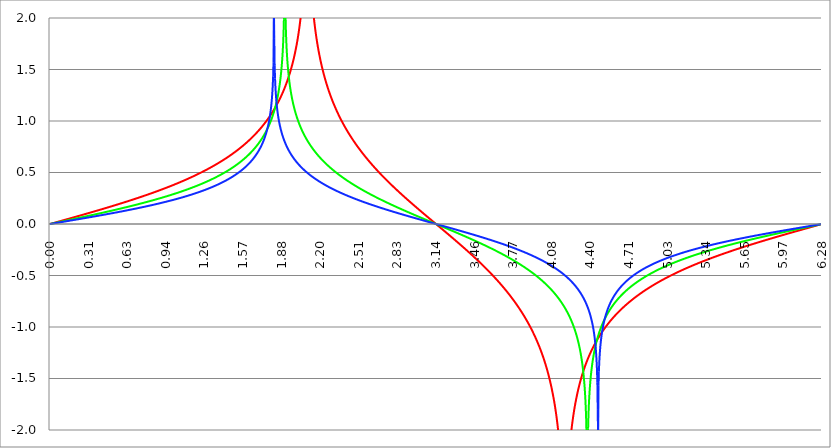
| Category | Series 1 | Series 0 | Series 2 |
|---|---|---|---|
| 0.0 | 0 | 0 | 0 |
| 0.00314159265358979 | 0.001 | 0.001 | 0.001 |
| 0.00628318530717958 | 0.002 | 0.002 | 0.001 |
| 0.00942477796076938 | 0.003 | 0.002 | 0.002 |
| 0.0125663706143592 | 0.004 | 0.003 | 0.003 |
| 0.015707963267949 | 0.005 | 0.004 | 0.003 |
| 0.0188495559215388 | 0.006 | 0.005 | 0.004 |
| 0.0219911485751285 | 0.007 | 0.005 | 0.004 |
| 0.0251327412287183 | 0.008 | 0.006 | 0.005 |
| 0.0282743338823081 | 0.009 | 0.007 | 0.006 |
| 0.0314159265358979 | 0.01 | 0.008 | 0.006 |
| 0.0345575191894877 | 0.012 | 0.009 | 0.007 |
| 0.0376991118430775 | 0.013 | 0.009 | 0.008 |
| 0.0408407044966673 | 0.014 | 0.01 | 0.008 |
| 0.0439822971502571 | 0.015 | 0.011 | 0.009 |
| 0.0471238898038469 | 0.016 | 0.012 | 0.009 |
| 0.0502654824574367 | 0.017 | 0.013 | 0.01 |
| 0.0534070751110265 | 0.018 | 0.013 | 0.011 |
| 0.0565486677646163 | 0.019 | 0.014 | 0.011 |
| 0.059690260418206 | 0.02 | 0.015 | 0.012 |
| 0.0628318530717958 | 0.021 | 0.016 | 0.013 |
| 0.0659734457253856 | 0.022 | 0.017 | 0.013 |
| 0.0691150383789754 | 0.023 | 0.017 | 0.014 |
| 0.0722566310325652 | 0.024 | 0.018 | 0.014 |
| 0.075398223686155 | 0.025 | 0.019 | 0.015 |
| 0.0785398163397448 | 0.026 | 0.02 | 0.016 |
| 0.0816814089933346 | 0.027 | 0.02 | 0.016 |
| 0.0848230016469244 | 0.028 | 0.021 | 0.017 |
| 0.0879645943005142 | 0.029 | 0.022 | 0.018 |
| 0.091106186954104 | 0.03 | 0.023 | 0.018 |
| 0.0942477796076937 | 0.031 | 0.024 | 0.019 |
| 0.0973893722612835 | 0.032 | 0.024 | 0.02 |
| 0.100530964914873 | 0.034 | 0.025 | 0.02 |
| 0.103672557568463 | 0.035 | 0.026 | 0.021 |
| 0.106814150222053 | 0.036 | 0.027 | 0.021 |
| 0.109955742875643 | 0.037 | 0.028 | 0.022 |
| 0.113097335529233 | 0.038 | 0.028 | 0.023 |
| 0.116238928182822 | 0.039 | 0.029 | 0.023 |
| 0.119380520836412 | 0.04 | 0.03 | 0.024 |
| 0.122522113490002 | 0.041 | 0.031 | 0.025 |
| 0.125663706143592 | 0.042 | 0.031 | 0.025 |
| 0.128805298797181 | 0.043 | 0.032 | 0.026 |
| 0.131946891450771 | 0.044 | 0.033 | 0.026 |
| 0.135088484104361 | 0.045 | 0.034 | 0.027 |
| 0.138230076757951 | 0.046 | 0.035 | 0.028 |
| 0.141371669411541 | 0.047 | 0.035 | 0.028 |
| 0.14451326206513 | 0.048 | 0.036 | 0.029 |
| 0.14765485471872 | 0.049 | 0.037 | 0.03 |
| 0.15079644737231 | 0.05 | 0.038 | 0.03 |
| 0.1539380400259 | 0.051 | 0.039 | 0.031 |
| 0.15707963267949 | 0.053 | 0.039 | 0.032 |
| 0.160221225333079 | 0.054 | 0.04 | 0.032 |
| 0.163362817986669 | 0.055 | 0.041 | 0.033 |
| 0.166504410640259 | 0.056 | 0.042 | 0.033 |
| 0.169646003293849 | 0.057 | 0.043 | 0.034 |
| 0.172787595947439 | 0.058 | 0.043 | 0.035 |
| 0.175929188601028 | 0.059 | 0.044 | 0.035 |
| 0.179070781254618 | 0.06 | 0.045 | 0.036 |
| 0.182212373908208 | 0.061 | 0.046 | 0.037 |
| 0.185353966561798 | 0.062 | 0.047 | 0.037 |
| 0.188495559215388 | 0.063 | 0.047 | 0.038 |
| 0.191637151868977 | 0.064 | 0.048 | 0.039 |
| 0.194778744522567 | 0.065 | 0.049 | 0.039 |
| 0.197920337176157 | 0.066 | 0.05 | 0.04 |
| 0.201061929829747 | 0.067 | 0.051 | 0.04 |
| 0.204203522483336 | 0.068 | 0.051 | 0.041 |
| 0.207345115136926 | 0.069 | 0.052 | 0.042 |
| 0.210486707790516 | 0.071 | 0.053 | 0.042 |
| 0.213628300444106 | 0.072 | 0.054 | 0.043 |
| 0.216769893097696 | 0.073 | 0.055 | 0.044 |
| 0.219911485751285 | 0.074 | 0.055 | 0.044 |
| 0.223053078404875 | 0.075 | 0.056 | 0.045 |
| 0.226194671058465 | 0.076 | 0.057 | 0.046 |
| 0.229336263712055 | 0.077 | 0.058 | 0.046 |
| 0.232477856365645 | 0.078 | 0.059 | 0.047 |
| 0.235619449019234 | 0.079 | 0.059 | 0.047 |
| 0.238761041672824 | 0.08 | 0.06 | 0.048 |
| 0.241902634326414 | 0.081 | 0.061 | 0.049 |
| 0.245044226980004 | 0.082 | 0.062 | 0.049 |
| 0.248185819633594 | 0.083 | 0.063 | 0.05 |
| 0.251327412287183 | 0.084 | 0.063 | 0.051 |
| 0.254469004940773 | 0.085 | 0.064 | 0.051 |
| 0.257610597594363 | 0.087 | 0.065 | 0.052 |
| 0.260752190247953 | 0.088 | 0.066 | 0.053 |
| 0.263893782901543 | 0.089 | 0.067 | 0.053 |
| 0.267035375555132 | 0.09 | 0.067 | 0.054 |
| 0.270176968208722 | 0.091 | 0.068 | 0.055 |
| 0.273318560862312 | 0.092 | 0.069 | 0.055 |
| 0.276460153515902 | 0.093 | 0.07 | 0.056 |
| 0.279601746169492 | 0.094 | 0.071 | 0.057 |
| 0.282743338823082 | 0.095 | 0.071 | 0.057 |
| 0.285884931476671 | 0.096 | 0.072 | 0.058 |
| 0.289026524130261 | 0.097 | 0.073 | 0.058 |
| 0.292168116783851 | 0.098 | 0.074 | 0.059 |
| 0.295309709437441 | 0.099 | 0.075 | 0.06 |
| 0.298451302091031 | 0.1 | 0.075 | 0.06 |
| 0.30159289474462 | 0.102 | 0.076 | 0.061 |
| 0.30473448739821 | 0.103 | 0.077 | 0.062 |
| 0.3078760800518 | 0.104 | 0.078 | 0.062 |
| 0.31101767270539 | 0.105 | 0.079 | 0.063 |
| 0.31415926535898 | 0.106 | 0.08 | 0.064 |
| 0.31730085801257 | 0.107 | 0.08 | 0.064 |
| 0.320442450666159 | 0.108 | 0.081 | 0.065 |
| 0.323584043319749 | 0.109 | 0.082 | 0.066 |
| 0.326725635973339 | 0.11 | 0.083 | 0.066 |
| 0.329867228626929 | 0.111 | 0.084 | 0.067 |
| 0.333008821280519 | 0.112 | 0.084 | 0.068 |
| 0.336150413934108 | 0.113 | 0.085 | 0.068 |
| 0.339292006587698 | 0.115 | 0.086 | 0.069 |
| 0.342433599241288 | 0.116 | 0.087 | 0.07 |
| 0.345575191894878 | 0.117 | 0.088 | 0.07 |
| 0.348716784548468 | 0.118 | 0.089 | 0.071 |
| 0.351858377202058 | 0.119 | 0.089 | 0.072 |
| 0.354999969855647 | 0.12 | 0.09 | 0.072 |
| 0.358141562509237 | 0.121 | 0.091 | 0.073 |
| 0.361283155162827 | 0.122 | 0.092 | 0.074 |
| 0.364424747816417 | 0.123 | 0.093 | 0.074 |
| 0.367566340470007 | 0.124 | 0.093 | 0.075 |
| 0.370707933123597 | 0.125 | 0.094 | 0.076 |
| 0.373849525777186 | 0.127 | 0.095 | 0.076 |
| 0.376991118430776 | 0.128 | 0.096 | 0.077 |
| 0.380132711084366 | 0.129 | 0.097 | 0.078 |
| 0.383274303737956 | 0.13 | 0.098 | 0.078 |
| 0.386415896391546 | 0.131 | 0.098 | 0.079 |
| 0.389557489045135 | 0.132 | 0.099 | 0.08 |
| 0.392699081698725 | 0.133 | 0.1 | 0.08 |
| 0.395840674352315 | 0.134 | 0.101 | 0.081 |
| 0.398982267005905 | 0.135 | 0.102 | 0.082 |
| 0.402123859659495 | 0.137 | 0.103 | 0.082 |
| 0.405265452313085 | 0.138 | 0.103 | 0.083 |
| 0.408407044966674 | 0.139 | 0.104 | 0.084 |
| 0.411548637620264 | 0.14 | 0.105 | 0.084 |
| 0.414690230273854 | 0.141 | 0.106 | 0.085 |
| 0.417831822927444 | 0.142 | 0.107 | 0.086 |
| 0.420973415581034 | 0.143 | 0.108 | 0.086 |
| 0.424115008234623 | 0.144 | 0.108 | 0.087 |
| 0.427256600888213 | 0.145 | 0.109 | 0.088 |
| 0.430398193541803 | 0.147 | 0.11 | 0.088 |
| 0.433539786195393 | 0.148 | 0.111 | 0.089 |
| 0.436681378848983 | 0.149 | 0.112 | 0.09 |
| 0.439822971502573 | 0.15 | 0.113 | 0.09 |
| 0.442964564156162 | 0.151 | 0.114 | 0.091 |
| 0.446106156809752 | 0.152 | 0.114 | 0.092 |
| 0.449247749463342 | 0.153 | 0.115 | 0.092 |
| 0.452389342116932 | 0.154 | 0.116 | 0.093 |
| 0.455530934770522 | 0.155 | 0.117 | 0.094 |
| 0.458672527424111 | 0.157 | 0.118 | 0.094 |
| 0.461814120077701 | 0.158 | 0.119 | 0.095 |
| 0.464955712731291 | 0.159 | 0.12 | 0.096 |
| 0.468097305384881 | 0.16 | 0.12 | 0.096 |
| 0.471238898038471 | 0.161 | 0.121 | 0.097 |
| 0.474380490692061 | 0.162 | 0.122 | 0.098 |
| 0.47752208334565 | 0.163 | 0.123 | 0.099 |
| 0.48066367599924 | 0.164 | 0.124 | 0.099 |
| 0.48380526865283 | 0.166 | 0.125 | 0.1 |
| 0.48694686130642 | 0.167 | 0.126 | 0.101 |
| 0.49008845396001 | 0.168 | 0.126 | 0.101 |
| 0.493230046613599 | 0.169 | 0.127 | 0.102 |
| 0.496371639267189 | 0.17 | 0.128 | 0.103 |
| 0.499513231920779 | 0.171 | 0.129 | 0.103 |
| 0.502654824574369 | 0.172 | 0.13 | 0.104 |
| 0.505796417227959 | 0.174 | 0.131 | 0.105 |
| 0.508938009881549 | 0.175 | 0.132 | 0.105 |
| 0.512079602535138 | 0.176 | 0.132 | 0.106 |
| 0.515221195188728 | 0.177 | 0.133 | 0.107 |
| 0.518362787842318 | 0.178 | 0.134 | 0.108 |
| 0.521504380495908 | 0.179 | 0.135 | 0.108 |
| 0.524645973149498 | 0.18 | 0.136 | 0.109 |
| 0.527787565803087 | 0.182 | 0.137 | 0.11 |
| 0.530929158456677 | 0.183 | 0.138 | 0.11 |
| 0.534070751110267 | 0.184 | 0.139 | 0.111 |
| 0.537212343763857 | 0.185 | 0.139 | 0.112 |
| 0.540353936417447 | 0.186 | 0.14 | 0.113 |
| 0.543495529071037 | 0.187 | 0.141 | 0.113 |
| 0.546637121724626 | 0.189 | 0.142 | 0.114 |
| 0.549778714378216 | 0.19 | 0.143 | 0.115 |
| 0.552920307031806 | 0.191 | 0.144 | 0.115 |
| 0.556061899685396 | 0.192 | 0.145 | 0.116 |
| 0.559203492338986 | 0.193 | 0.146 | 0.117 |
| 0.562345084992576 | 0.194 | 0.146 | 0.118 |
| 0.565486677646165 | 0.196 | 0.147 | 0.118 |
| 0.568628270299755 | 0.197 | 0.148 | 0.119 |
| 0.571769862953345 | 0.198 | 0.149 | 0.12 |
| 0.574911455606935 | 0.199 | 0.15 | 0.12 |
| 0.578053048260525 | 0.2 | 0.151 | 0.121 |
| 0.581194640914114 | 0.201 | 0.152 | 0.122 |
| 0.584336233567704 | 0.203 | 0.153 | 0.123 |
| 0.587477826221294 | 0.204 | 0.154 | 0.123 |
| 0.590619418874884 | 0.205 | 0.155 | 0.124 |
| 0.593761011528474 | 0.206 | 0.155 | 0.125 |
| 0.596902604182064 | 0.207 | 0.156 | 0.125 |
| 0.600044196835653 | 0.208 | 0.157 | 0.126 |
| 0.603185789489243 | 0.21 | 0.158 | 0.127 |
| 0.606327382142833 | 0.211 | 0.159 | 0.128 |
| 0.609468974796423 | 0.212 | 0.16 | 0.128 |
| 0.612610567450013 | 0.213 | 0.161 | 0.129 |
| 0.615752160103602 | 0.214 | 0.162 | 0.13 |
| 0.618893752757192 | 0.216 | 0.163 | 0.131 |
| 0.622035345410782 | 0.217 | 0.164 | 0.131 |
| 0.625176938064372 | 0.218 | 0.164 | 0.132 |
| 0.628318530717962 | 0.219 | 0.165 | 0.133 |
| 0.631460123371551 | 0.22 | 0.166 | 0.134 |
| 0.634601716025141 | 0.222 | 0.167 | 0.134 |
| 0.637743308678731 | 0.223 | 0.168 | 0.135 |
| 0.640884901332321 | 0.224 | 0.169 | 0.136 |
| 0.644026493985911 | 0.225 | 0.17 | 0.137 |
| 0.647168086639501 | 0.226 | 0.171 | 0.137 |
| 0.65030967929309 | 0.228 | 0.172 | 0.138 |
| 0.65345127194668 | 0.229 | 0.173 | 0.139 |
| 0.65659286460027 | 0.23 | 0.174 | 0.14 |
| 0.65973445725386 | 0.231 | 0.175 | 0.14 |
| 0.66287604990745 | 0.233 | 0.176 | 0.141 |
| 0.666017642561039 | 0.234 | 0.177 | 0.142 |
| 0.669159235214629 | 0.235 | 0.177 | 0.143 |
| 0.672300827868219 | 0.236 | 0.178 | 0.143 |
| 0.675442420521809 | 0.237 | 0.179 | 0.144 |
| 0.678584013175399 | 0.239 | 0.18 | 0.145 |
| 0.681725605828989 | 0.24 | 0.181 | 0.146 |
| 0.684867198482578 | 0.241 | 0.182 | 0.146 |
| 0.688008791136168 | 0.242 | 0.183 | 0.147 |
| 0.691150383789758 | 0.244 | 0.184 | 0.148 |
| 0.694291976443348 | 0.245 | 0.185 | 0.149 |
| 0.697433569096938 | 0.246 | 0.186 | 0.149 |
| 0.700575161750528 | 0.247 | 0.187 | 0.15 |
| 0.703716754404117 | 0.249 | 0.188 | 0.151 |
| 0.706858347057707 | 0.25 | 0.189 | 0.152 |
| 0.709999939711297 | 0.251 | 0.19 | 0.153 |
| 0.713141532364887 | 0.252 | 0.191 | 0.153 |
| 0.716283125018477 | 0.254 | 0.192 | 0.154 |
| 0.719424717672066 | 0.255 | 0.193 | 0.155 |
| 0.722566310325656 | 0.256 | 0.194 | 0.156 |
| 0.725707902979246 | 0.257 | 0.195 | 0.156 |
| 0.728849495632836 | 0.259 | 0.196 | 0.157 |
| 0.731991088286426 | 0.26 | 0.197 | 0.158 |
| 0.735132680940016 | 0.261 | 0.198 | 0.159 |
| 0.738274273593605 | 0.262 | 0.198 | 0.16 |
| 0.741415866247195 | 0.264 | 0.199 | 0.16 |
| 0.744557458900785 | 0.265 | 0.2 | 0.161 |
| 0.747699051554375 | 0.266 | 0.201 | 0.162 |
| 0.750840644207965 | 0.267 | 0.202 | 0.163 |
| 0.753982236861554 | 0.269 | 0.203 | 0.164 |
| 0.757123829515144 | 0.27 | 0.204 | 0.164 |
| 0.760265422168734 | 0.271 | 0.205 | 0.165 |
| 0.763407014822324 | 0.273 | 0.206 | 0.166 |
| 0.766548607475914 | 0.274 | 0.207 | 0.167 |
| 0.769690200129504 | 0.275 | 0.208 | 0.168 |
| 0.772831792783093 | 0.276 | 0.209 | 0.168 |
| 0.775973385436683 | 0.278 | 0.21 | 0.169 |
| 0.779114978090273 | 0.279 | 0.211 | 0.17 |
| 0.782256570743863 | 0.28 | 0.212 | 0.171 |
| 0.785398163397453 | 0.282 | 0.213 | 0.172 |
| 0.788539756051042 | 0.283 | 0.214 | 0.173 |
| 0.791681348704632 | 0.284 | 0.215 | 0.173 |
| 0.794822941358222 | 0.286 | 0.216 | 0.174 |
| 0.797964534011812 | 0.287 | 0.217 | 0.175 |
| 0.801106126665402 | 0.288 | 0.218 | 0.176 |
| 0.804247719318992 | 0.289 | 0.219 | 0.177 |
| 0.807389311972581 | 0.291 | 0.22 | 0.178 |
| 0.810530904626171 | 0.292 | 0.221 | 0.178 |
| 0.813672497279761 | 0.293 | 0.223 | 0.179 |
| 0.816814089933351 | 0.295 | 0.224 | 0.18 |
| 0.819955682586941 | 0.296 | 0.225 | 0.181 |
| 0.823097275240531 | 0.297 | 0.226 | 0.182 |
| 0.82623886789412 | 0.299 | 0.227 | 0.183 |
| 0.82938046054771 | 0.3 | 0.228 | 0.183 |
| 0.8325220532013 | 0.301 | 0.229 | 0.184 |
| 0.83566364585489 | 0.303 | 0.23 | 0.185 |
| 0.83880523850848 | 0.304 | 0.231 | 0.186 |
| 0.841946831162069 | 0.305 | 0.232 | 0.187 |
| 0.845088423815659 | 0.307 | 0.233 | 0.188 |
| 0.848230016469249 | 0.308 | 0.234 | 0.189 |
| 0.851371609122839 | 0.309 | 0.235 | 0.189 |
| 0.854513201776429 | 0.311 | 0.236 | 0.19 |
| 0.857654794430019 | 0.312 | 0.237 | 0.191 |
| 0.860796387083608 | 0.314 | 0.238 | 0.192 |
| 0.863937979737198 | 0.315 | 0.239 | 0.193 |
| 0.867079572390788 | 0.316 | 0.24 | 0.194 |
| 0.870221165044378 | 0.318 | 0.241 | 0.195 |
| 0.873362757697968 | 0.319 | 0.242 | 0.196 |
| 0.876504350351557 | 0.32 | 0.244 | 0.196 |
| 0.879645943005147 | 0.322 | 0.245 | 0.197 |
| 0.882787535658737 | 0.323 | 0.246 | 0.198 |
| 0.885929128312327 | 0.325 | 0.247 | 0.199 |
| 0.889070720965917 | 0.326 | 0.248 | 0.2 |
| 0.892212313619507 | 0.327 | 0.249 | 0.201 |
| 0.895353906273096 | 0.329 | 0.25 | 0.202 |
| 0.898495498926686 | 0.33 | 0.251 | 0.203 |
| 0.901637091580276 | 0.332 | 0.252 | 0.204 |
| 0.904778684233866 | 0.333 | 0.253 | 0.204 |
| 0.907920276887456 | 0.334 | 0.254 | 0.205 |
| 0.911061869541045 | 0.336 | 0.256 | 0.206 |
| 0.914203462194635 | 0.337 | 0.257 | 0.207 |
| 0.917345054848225 | 0.339 | 0.258 | 0.208 |
| 0.920486647501815 | 0.34 | 0.259 | 0.209 |
| 0.923628240155405 | 0.341 | 0.26 | 0.21 |
| 0.926769832808995 | 0.343 | 0.261 | 0.211 |
| 0.929911425462584 | 0.344 | 0.262 | 0.212 |
| 0.933053018116174 | 0.346 | 0.263 | 0.213 |
| 0.936194610769764 | 0.347 | 0.264 | 0.214 |
| 0.939336203423354 | 0.349 | 0.266 | 0.215 |
| 0.942477796076944 | 0.35 | 0.267 | 0.216 |
| 0.945619388730533 | 0.351 | 0.268 | 0.216 |
| 0.948760981384123 | 0.353 | 0.269 | 0.217 |
| 0.951902574037713 | 0.354 | 0.27 | 0.218 |
| 0.955044166691303 | 0.356 | 0.271 | 0.219 |
| 0.958185759344893 | 0.357 | 0.272 | 0.22 |
| 0.961327351998483 | 0.359 | 0.274 | 0.221 |
| 0.964468944652072 | 0.36 | 0.275 | 0.222 |
| 0.967610537305662 | 0.362 | 0.276 | 0.223 |
| 0.970752129959252 | 0.363 | 0.277 | 0.224 |
| 0.973893722612842 | 0.365 | 0.278 | 0.225 |
| 0.977035315266432 | 0.366 | 0.279 | 0.226 |
| 0.980176907920022 | 0.368 | 0.281 | 0.227 |
| 0.983318500573611 | 0.369 | 0.282 | 0.228 |
| 0.986460093227201 | 0.371 | 0.283 | 0.229 |
| 0.989601685880791 | 0.372 | 0.284 | 0.23 |
| 0.992743278534381 | 0.374 | 0.285 | 0.231 |
| 0.995884871187971 | 0.375 | 0.287 | 0.232 |
| 0.99902646384156 | 0.377 | 0.288 | 0.233 |
| 1.00216805649515 | 0.378 | 0.289 | 0.234 |
| 1.00530964914874 | 0.38 | 0.29 | 0.235 |
| 1.00845124180233 | 0.381 | 0.291 | 0.236 |
| 1.01159283445592 | 0.383 | 0.293 | 0.237 |
| 1.01473442710951 | 0.384 | 0.294 | 0.238 |
| 1.017876019763099 | 0.386 | 0.295 | 0.239 |
| 1.021017612416689 | 0.387 | 0.296 | 0.24 |
| 1.02415920507028 | 0.389 | 0.297 | 0.241 |
| 1.027300797723869 | 0.39 | 0.299 | 0.242 |
| 1.030442390377459 | 0.392 | 0.3 | 0.243 |
| 1.033583983031048 | 0.393 | 0.301 | 0.244 |
| 1.036725575684638 | 0.395 | 0.302 | 0.245 |
| 1.039867168338228 | 0.397 | 0.304 | 0.246 |
| 1.043008760991818 | 0.398 | 0.305 | 0.247 |
| 1.046150353645408 | 0.4 | 0.306 | 0.248 |
| 1.049291946298998 | 0.401 | 0.307 | 0.249 |
| 1.052433538952587 | 0.403 | 0.309 | 0.25 |
| 1.055575131606177 | 0.404 | 0.31 | 0.251 |
| 1.058716724259767 | 0.406 | 0.311 | 0.252 |
| 1.061858316913357 | 0.408 | 0.312 | 0.253 |
| 1.064999909566947 | 0.409 | 0.314 | 0.254 |
| 1.068141502220536 | 0.411 | 0.315 | 0.256 |
| 1.071283094874126 | 0.412 | 0.316 | 0.257 |
| 1.074424687527716 | 0.414 | 0.318 | 0.258 |
| 1.077566280181306 | 0.416 | 0.319 | 0.259 |
| 1.080707872834896 | 0.417 | 0.32 | 0.26 |
| 1.083849465488486 | 0.419 | 0.321 | 0.261 |
| 1.086991058142075 | 0.42 | 0.323 | 0.262 |
| 1.090132650795665 | 0.422 | 0.324 | 0.263 |
| 1.093274243449255 | 0.424 | 0.325 | 0.264 |
| 1.096415836102845 | 0.425 | 0.327 | 0.265 |
| 1.099557428756435 | 0.427 | 0.328 | 0.267 |
| 1.102699021410025 | 0.429 | 0.329 | 0.268 |
| 1.105840614063614 | 0.43 | 0.331 | 0.269 |
| 1.108982206717204 | 0.432 | 0.332 | 0.27 |
| 1.112123799370794 | 0.434 | 0.333 | 0.271 |
| 1.115265392024384 | 0.435 | 0.335 | 0.272 |
| 1.118406984677974 | 0.437 | 0.336 | 0.273 |
| 1.121548577331563 | 0.439 | 0.338 | 0.274 |
| 1.124690169985153 | 0.44 | 0.339 | 0.276 |
| 1.127831762638743 | 0.442 | 0.34 | 0.277 |
| 1.130973355292333 | 0.444 | 0.342 | 0.278 |
| 1.134114947945923 | 0.445 | 0.343 | 0.279 |
| 1.137256540599513 | 0.447 | 0.344 | 0.28 |
| 1.140398133253102 | 0.449 | 0.346 | 0.281 |
| 1.143539725906692 | 0.451 | 0.347 | 0.283 |
| 1.146681318560282 | 0.452 | 0.349 | 0.284 |
| 1.149822911213872 | 0.454 | 0.35 | 0.285 |
| 1.152964503867462 | 0.456 | 0.351 | 0.286 |
| 1.156106096521051 | 0.457 | 0.353 | 0.287 |
| 1.159247689174641 | 0.459 | 0.354 | 0.289 |
| 1.162389281828231 | 0.461 | 0.356 | 0.29 |
| 1.165530874481821 | 0.463 | 0.357 | 0.291 |
| 1.168672467135411 | 0.464 | 0.359 | 0.292 |
| 1.171814059789001 | 0.466 | 0.36 | 0.293 |
| 1.17495565244259 | 0.468 | 0.361 | 0.295 |
| 1.17809724509618 | 0.47 | 0.363 | 0.296 |
| 1.18123883774977 | 0.472 | 0.364 | 0.297 |
| 1.18438043040336 | 0.473 | 0.366 | 0.298 |
| 1.18752202305695 | 0.475 | 0.367 | 0.3 |
| 1.190663615710539 | 0.477 | 0.369 | 0.301 |
| 1.193805208364129 | 0.479 | 0.37 | 0.302 |
| 1.19694680101772 | 0.481 | 0.372 | 0.303 |
| 1.200088393671309 | 0.482 | 0.373 | 0.305 |
| 1.203229986324899 | 0.484 | 0.375 | 0.306 |
| 1.206371578978489 | 0.486 | 0.376 | 0.307 |
| 1.209513171632078 | 0.488 | 0.378 | 0.309 |
| 1.212654764285668 | 0.49 | 0.379 | 0.31 |
| 1.215796356939258 | 0.492 | 0.381 | 0.311 |
| 1.218937949592848 | 0.493 | 0.382 | 0.313 |
| 1.222079542246438 | 0.495 | 0.384 | 0.314 |
| 1.225221134900027 | 0.497 | 0.386 | 0.315 |
| 1.228362727553617 | 0.499 | 0.387 | 0.317 |
| 1.231504320207207 | 0.501 | 0.389 | 0.318 |
| 1.234645912860797 | 0.503 | 0.39 | 0.319 |
| 1.237787505514387 | 0.505 | 0.392 | 0.321 |
| 1.240929098167977 | 0.507 | 0.393 | 0.322 |
| 1.244070690821566 | 0.508 | 0.395 | 0.323 |
| 1.247212283475156 | 0.51 | 0.397 | 0.325 |
| 1.250353876128746 | 0.512 | 0.398 | 0.326 |
| 1.253495468782336 | 0.514 | 0.4 | 0.327 |
| 1.256637061435926 | 0.516 | 0.401 | 0.329 |
| 1.259778654089515 | 0.518 | 0.403 | 0.33 |
| 1.262920246743105 | 0.52 | 0.405 | 0.332 |
| 1.266061839396695 | 0.522 | 0.406 | 0.333 |
| 1.269203432050285 | 0.524 | 0.408 | 0.335 |
| 1.272345024703875 | 0.526 | 0.41 | 0.336 |
| 1.275486617357465 | 0.528 | 0.411 | 0.337 |
| 1.278628210011054 | 0.53 | 0.413 | 0.339 |
| 1.281769802664644 | 0.532 | 0.415 | 0.34 |
| 1.284911395318234 | 0.534 | 0.416 | 0.342 |
| 1.288052987971824 | 0.536 | 0.418 | 0.343 |
| 1.291194580625414 | 0.538 | 0.42 | 0.345 |
| 1.294336173279003 | 0.54 | 0.422 | 0.346 |
| 1.297477765932593 | 0.542 | 0.423 | 0.348 |
| 1.300619358586183 | 0.544 | 0.425 | 0.349 |
| 1.303760951239773 | 0.546 | 0.427 | 0.351 |
| 1.306902543893363 | 0.548 | 0.429 | 0.352 |
| 1.310044136546953 | 0.55 | 0.43 | 0.354 |
| 1.313185729200542 | 0.552 | 0.432 | 0.355 |
| 1.316327321854132 | 0.554 | 0.434 | 0.357 |
| 1.319468914507722 | 0.557 | 0.436 | 0.359 |
| 1.322610507161312 | 0.559 | 0.438 | 0.36 |
| 1.325752099814902 | 0.561 | 0.439 | 0.362 |
| 1.328893692468491 | 0.563 | 0.441 | 0.363 |
| 1.332035285122081 | 0.565 | 0.443 | 0.365 |
| 1.335176877775671 | 0.567 | 0.445 | 0.367 |
| 1.338318470429261 | 0.569 | 0.447 | 0.368 |
| 1.341460063082851 | 0.571 | 0.449 | 0.37 |
| 1.344601655736441 | 0.574 | 0.45 | 0.372 |
| 1.34774324839003 | 0.576 | 0.452 | 0.373 |
| 1.35088484104362 | 0.578 | 0.454 | 0.375 |
| 1.35402643369721 | 0.58 | 0.456 | 0.377 |
| 1.3571680263508 | 0.582 | 0.458 | 0.378 |
| 1.36030961900439 | 0.585 | 0.46 | 0.38 |
| 1.363451211657979 | 0.587 | 0.462 | 0.382 |
| 1.36659280431157 | 0.589 | 0.464 | 0.383 |
| 1.369734396965159 | 0.591 | 0.466 | 0.385 |
| 1.372875989618749 | 0.594 | 0.468 | 0.387 |
| 1.376017582272339 | 0.596 | 0.47 | 0.389 |
| 1.379159174925929 | 0.598 | 0.472 | 0.39 |
| 1.382300767579518 | 0.6 | 0.474 | 0.392 |
| 1.385442360233108 | 0.603 | 0.476 | 0.394 |
| 1.388583952886698 | 0.605 | 0.478 | 0.396 |
| 1.391725545540288 | 0.607 | 0.48 | 0.398 |
| 1.394867138193878 | 0.61 | 0.482 | 0.4 |
| 1.398008730847468 | 0.612 | 0.484 | 0.401 |
| 1.401150323501057 | 0.614 | 0.486 | 0.403 |
| 1.404291916154647 | 0.617 | 0.488 | 0.405 |
| 1.407433508808237 | 0.619 | 0.49 | 0.407 |
| 1.410575101461827 | 0.621 | 0.492 | 0.409 |
| 1.413716694115417 | 0.624 | 0.494 | 0.411 |
| 1.416858286769006 | 0.626 | 0.497 | 0.413 |
| 1.419999879422596 | 0.629 | 0.499 | 0.415 |
| 1.423141472076186 | 0.631 | 0.501 | 0.417 |
| 1.426283064729776 | 0.633 | 0.503 | 0.419 |
| 1.429424657383366 | 0.636 | 0.505 | 0.421 |
| 1.432566250036956 | 0.638 | 0.508 | 0.423 |
| 1.435707842690545 | 0.641 | 0.51 | 0.425 |
| 1.438849435344135 | 0.643 | 0.512 | 0.427 |
| 1.441991027997725 | 0.646 | 0.514 | 0.429 |
| 1.445132620651315 | 0.648 | 0.517 | 0.431 |
| 1.448274213304905 | 0.651 | 0.519 | 0.433 |
| 1.451415805958494 | 0.653 | 0.521 | 0.435 |
| 1.454557398612084 | 0.656 | 0.523 | 0.437 |
| 1.457698991265674 | 0.658 | 0.526 | 0.439 |
| 1.460840583919264 | 0.661 | 0.528 | 0.442 |
| 1.463982176572854 | 0.664 | 0.531 | 0.444 |
| 1.467123769226444 | 0.666 | 0.533 | 0.446 |
| 1.470265361880033 | 0.669 | 0.535 | 0.448 |
| 1.473406954533623 | 0.671 | 0.538 | 0.451 |
| 1.476548547187213 | 0.674 | 0.54 | 0.453 |
| 1.479690139840803 | 0.677 | 0.543 | 0.455 |
| 1.482831732494393 | 0.679 | 0.545 | 0.457 |
| 1.485973325147982 | 0.682 | 0.548 | 0.46 |
| 1.489114917801572 | 0.685 | 0.55 | 0.462 |
| 1.492256510455162 | 0.687 | 0.553 | 0.464 |
| 1.495398103108752 | 0.69 | 0.555 | 0.467 |
| 1.498539695762342 | 0.693 | 0.558 | 0.469 |
| 1.501681288415932 | 0.696 | 0.56 | 0.472 |
| 1.504822881069521 | 0.698 | 0.563 | 0.474 |
| 1.507964473723111 | 0.701 | 0.566 | 0.477 |
| 1.511106066376701 | 0.704 | 0.568 | 0.479 |
| 1.514247659030291 | 0.707 | 0.571 | 0.482 |
| 1.517389251683881 | 0.71 | 0.574 | 0.484 |
| 1.520530844337471 | 0.712 | 0.576 | 0.487 |
| 1.52367243699106 | 0.715 | 0.579 | 0.49 |
| 1.52681402964465 | 0.718 | 0.582 | 0.492 |
| 1.52995562229824 | 0.721 | 0.585 | 0.495 |
| 1.53309721495183 | 0.724 | 0.588 | 0.498 |
| 1.53623880760542 | 0.727 | 0.59 | 0.5 |
| 1.539380400259009 | 0.73 | 0.593 | 0.503 |
| 1.542521992912599 | 0.733 | 0.596 | 0.506 |
| 1.545663585566189 | 0.736 | 0.599 | 0.509 |
| 1.548805178219779 | 0.739 | 0.602 | 0.512 |
| 1.551946770873369 | 0.742 | 0.605 | 0.515 |
| 1.555088363526959 | 0.745 | 0.608 | 0.518 |
| 1.558229956180548 | 0.748 | 0.611 | 0.521 |
| 1.561371548834138 | 0.751 | 0.614 | 0.524 |
| 1.564513141487728 | 0.754 | 0.617 | 0.527 |
| 1.567654734141318 | 0.757 | 0.62 | 0.53 |
| 1.570796326794908 | 0.76 | 0.623 | 0.533 |
| 1.573937919448497 | 0.763 | 0.626 | 0.536 |
| 1.577079512102087 | 0.767 | 0.63 | 0.539 |
| 1.580221104755677 | 0.77 | 0.633 | 0.542 |
| 1.583362697409267 | 0.773 | 0.636 | 0.546 |
| 1.586504290062857 | 0.776 | 0.639 | 0.549 |
| 1.589645882716447 | 0.78 | 0.643 | 0.552 |
| 1.592787475370036 | 0.783 | 0.646 | 0.556 |
| 1.595929068023626 | 0.786 | 0.649 | 0.559 |
| 1.599070660677216 | 0.789 | 0.653 | 0.563 |
| 1.602212253330806 | 0.793 | 0.656 | 0.566 |
| 1.605353845984396 | 0.796 | 0.66 | 0.57 |
| 1.608495438637985 | 0.8 | 0.663 | 0.574 |
| 1.611637031291575 | 0.803 | 0.667 | 0.577 |
| 1.614778623945165 | 0.806 | 0.67 | 0.581 |
| 1.617920216598755 | 0.81 | 0.674 | 0.585 |
| 1.621061809252345 | 0.813 | 0.678 | 0.589 |
| 1.624203401905935 | 0.817 | 0.681 | 0.593 |
| 1.627344994559524 | 0.82 | 0.685 | 0.597 |
| 1.630486587213114 | 0.824 | 0.689 | 0.601 |
| 1.633628179866704 | 0.827 | 0.693 | 0.605 |
| 1.636769772520294 | 0.831 | 0.697 | 0.609 |
| 1.639911365173884 | 0.835 | 0.701 | 0.614 |
| 1.643052957827473 | 0.838 | 0.705 | 0.618 |
| 1.646194550481063 | 0.842 | 0.709 | 0.623 |
| 1.649336143134653 | 0.846 | 0.713 | 0.627 |
| 1.652477735788243 | 0.85 | 0.717 | 0.632 |
| 1.655619328441833 | 0.853 | 0.721 | 0.636 |
| 1.658760921095423 | 0.857 | 0.725 | 0.641 |
| 1.661902513749012 | 0.861 | 0.73 | 0.646 |
| 1.665044106402602 | 0.865 | 0.734 | 0.651 |
| 1.668185699056192 | 0.869 | 0.738 | 0.656 |
| 1.671327291709782 | 0.873 | 0.743 | 0.661 |
| 1.674468884363372 | 0.877 | 0.747 | 0.667 |
| 1.677610477016961 | 0.88 | 0.752 | 0.672 |
| 1.680752069670551 | 0.885 | 0.757 | 0.678 |
| 1.683893662324141 | 0.889 | 0.761 | 0.683 |
| 1.687035254977731 | 0.893 | 0.766 | 0.689 |
| 1.690176847631321 | 0.897 | 0.771 | 0.695 |
| 1.693318440284911 | 0.901 | 0.776 | 0.701 |
| 1.6964600329385 | 0.905 | 0.781 | 0.707 |
| 1.69960162559209 | 0.909 | 0.786 | 0.714 |
| 1.70274321824568 | 0.913 | 0.791 | 0.72 |
| 1.70588481089927 | 0.918 | 0.796 | 0.727 |
| 1.70902640355286 | 0.922 | 0.802 | 0.734 |
| 1.712167996206449 | 0.926 | 0.807 | 0.741 |
| 1.715309588860039 | 0.931 | 0.813 | 0.748 |
| 1.71845118151363 | 0.935 | 0.818 | 0.756 |
| 1.721592774167219 | 0.94 | 0.824 | 0.763 |
| 1.724734366820809 | 0.944 | 0.83 | 0.771 |
| 1.727875959474399 | 0.949 | 0.835 | 0.78 |
| 1.731017552127988 | 0.953 | 0.841 | 0.788 |
| 1.734159144781578 | 0.958 | 0.847 | 0.797 |
| 1.737300737435168 | 0.963 | 0.854 | 0.806 |
| 1.740442330088758 | 0.967 | 0.86 | 0.816 |
| 1.743583922742348 | 0.972 | 0.866 | 0.826 |
| 1.746725515395937 | 0.977 | 0.873 | 0.836 |
| 1.749867108049527 | 0.982 | 0.88 | 0.847 |
| 1.753008700703117 | 0.987 | 0.886 | 0.858 |
| 1.756150293356707 | 0.992 | 0.893 | 0.869 |
| 1.759291886010297 | 0.997 | 0.901 | 0.882 |
| 1.762433478663887 | 1.002 | 0.908 | 0.895 |
| 1.765575071317476 | 1.007 | 0.915 | 0.908 |
| 1.768716663971066 | 1.012 | 0.923 | 0.922 |
| 1.771858256624656 | 1.017 | 0.93 | 0.938 |
| 1.774999849278246 | 1.022 | 0.938 | 0.954 |
| 1.778141441931836 | 1.028 | 0.947 | 0.971 |
| 1.781283034585426 | 1.033 | 0.955 | 0.989 |
| 1.784424627239015 | 1.039 | 0.963 | 1.009 |
| 1.787566219892605 | 1.044 | 0.972 | 1.031 |
| 1.790707812546195 | 1.05 | 0.981 | 1.054 |
| 1.793849405199785 | 1.055 | 0.99 | 1.08 |
| 1.796990997853375 | 1.061 | 1 | 1.109 |
| 1.800132590506964 | 1.067 | 1.01 | 1.142 |
| 1.803274183160554 | 1.072 | 1.02 | 1.179 |
| 1.806415775814144 | 1.078 | 1.03 | 1.222 |
| 1.809557368467734 | 1.084 | 1.041 | 1.275 |
| 1.812698961121324 | 1.09 | 1.052 | 1.341 |
| 1.815840553774914 | 1.096 | 1.063 | 1.43 |
| 1.818982146428503 | 1.102 | 1.075 | 1.566 |
| 1.822123739082093 | 1.109 | 1.087 | 2.1 |
| 1.825265331735683 | 1.115 | 1.099 | 1.804 |
| 1.828406924389273 | 1.121 | 1.112 | 1.542 |
| 1.831548517042863 | 1.128 | 1.126 | 1.415 |
| 1.834690109696452 | 1.134 | 1.14 | 1.33 |
| 1.837831702350042 | 1.141 | 1.155 | 1.266 |
| 1.840973295003632 | 1.148 | 1.17 | 1.215 |
| 1.844114887657222 | 1.154 | 1.186 | 1.172 |
| 1.847256480310812 | 1.161 | 1.203 | 1.135 |
| 1.850398072964402 | 1.168 | 1.221 | 1.103 |
| 1.853539665617991 | 1.175 | 1.24 | 1.074 |
| 1.856681258271581 | 1.182 | 1.26 | 1.049 |
| 1.859822850925171 | 1.19 | 1.281 | 1.025 |
| 1.862964443578761 | 1.197 | 1.303 | 1.004 |
| 1.866106036232351 | 1.204 | 1.327 | 0.984 |
| 1.86924762888594 | 1.212 | 1.353 | 0.965 |
| 1.87238922153953 | 1.22 | 1.38 | 0.948 |
| 1.87553081419312 | 1.228 | 1.411 | 0.932 |
| 1.87867240684671 | 1.235 | 1.444 | 0.917 |
| 1.8818139995003 | 1.243 | 1.48 | 0.902 |
| 1.88495559215389 | 1.252 | 1.521 | 0.889 |
| 1.888097184807479 | 1.26 | 1.567 | 0.876 |
| 1.891238777461069 | 1.268 | 1.619 | 0.863 |
| 1.89438037011466 | 1.277 | 1.682 | 0.851 |
| 1.897521962768249 | 1.286 | 1.757 | 0.84 |
| 1.900663555421839 | 1.294 | 1.854 | 0.829 |
| 1.903805148075429 | 1.303 | 1.988 | 0.819 |
| 1.906946740729018 | 1.313 | 2.205 | 0.809 |
| 1.910088333382608 | 1.322 | 2.881 | 0.799 |
| 1.913229926036198 | 1.331 | 2.329 | 0.79 |
| 1.916371518689788 | 1.341 | 2.048 | 0.781 |
| 1.919513111343378 | 1.351 | 1.894 | 0.772 |
| 1.922654703996967 | 1.361 | 1.787 | 0.764 |
| 1.925796296650557 | 1.371 | 1.704 | 0.756 |
| 1.928937889304147 | 1.381 | 1.638 | 0.748 |
| 1.932079481957737 | 1.392 | 1.581 | 0.74 |
| 1.935221074611327 | 1.403 | 1.533 | 0.732 |
| 1.938362667264917 | 1.414 | 1.49 | 0.725 |
| 1.941504259918506 | 1.425 | 1.452 | 0.718 |
| 1.944645852572096 | 1.437 | 1.417 | 0.711 |
| 1.947787445225686 | 1.449 | 1.386 | 0.704 |
| 1.950929037879276 | 1.461 | 1.357 | 0.698 |
| 1.954070630532866 | 1.473 | 1.33 | 0.691 |
| 1.957212223186455 | 1.486 | 1.305 | 0.685 |
| 1.960353815840045 | 1.498 | 1.282 | 0.679 |
| 1.963495408493635 | 1.512 | 1.26 | 0.673 |
| 1.966637001147225 | 1.525 | 1.24 | 0.667 |
| 1.969778593800815 | 1.539 | 1.22 | 0.662 |
| 1.972920186454405 | 1.553 | 1.202 | 0.656 |
| 1.976061779107994 | 1.568 | 1.184 | 0.65 |
| 1.979203371761584 | 1.583 | 1.167 | 0.645 |
| 1.982344964415174 | 1.599 | 1.151 | 0.64 |
| 1.985486557068764 | 1.615 | 1.136 | 0.635 |
| 1.988628149722354 | 1.631 | 1.121 | 0.629 |
| 1.991769742375943 | 1.648 | 1.107 | 0.624 |
| 1.994911335029533 | 1.665 | 1.093 | 0.62 |
| 1.998052927683123 | 1.683 | 1.08 | 0.615 |
| 2.001194520336712 | 1.702 | 1.067 | 0.61 |
| 2.004336112990302 | 1.721 | 1.055 | 0.605 |
| 2.007477705643892 | 1.741 | 1.043 | 0.601 |
| 2.010619298297482 | 1.762 | 1.032 | 0.596 |
| 2.013760890951071 | 1.784 | 1.021 | 0.592 |
| 2.016902483604661 | 1.806 | 1.01 | 0.587 |
| 2.02004407625825 | 1.83 | 0.999 | 0.583 |
| 2.02318566891184 | 1.854 | 0.989 | 0.579 |
| 2.02632726156543 | 1.88 | 0.979 | 0.575 |
| 2.029468854219019 | 1.906 | 0.969 | 0.571 |
| 2.032610446872609 | 1.935 | 0.96 | 0.567 |
| 2.035752039526198 | 1.964 | 0.951 | 0.563 |
| 2.038893632179788 | 1.995 | 0.942 | 0.559 |
| 2.042035224833378 | 2.029 | 0.933 | 0.555 |
| 2.045176817486967 | 2.064 | 0.924 | 0.551 |
| 2.048318410140557 | 2.101 | 0.916 | 0.547 |
| 2.051460002794146 | 2.142 | 0.908 | 0.544 |
| 2.054601595447736 | 2.185 | 0.9 | 0.54 |
| 2.057743188101325 | 2.232 | 0.892 | 0.536 |
| 2.060884780754915 | 2.283 | 0.884 | 0.533 |
| 2.064026373408505 | 2.34 | 0.877 | 0.529 |
| 2.067167966062094 | 2.402 | 0.869 | 0.526 |
| 2.070309558715684 | 2.472 | 0.862 | 0.522 |
| 2.073451151369273 | 2.553 | 0.855 | 0.519 |
| 2.076592744022863 | 2.646 | 0.848 | 0.515 |
| 2.079734336676452 | 2.757 | 0.841 | 0.512 |
| 2.082875929330042 | 2.896 | 0.834 | 0.509 |
| 2.086017521983632 | 3.08 | 0.828 | 0.505 |
| 2.089159114637221 | 3.35 | 0.821 | 0.502 |
| 2.092300707290811 | 3.879 | 0.815 | 0.499 |
| 2.095442299944401 | 4.279 | 0.808 | 0.496 |
| 2.09858389259799 | 3.478 | 0.802 | 0.493 |
| 2.10172548525158 | 3.154 | 0.796 | 0.49 |
| 2.104867077905169 | 2.948 | 0.79 | 0.487 |
| 2.108008670558759 | 2.796 | 0.784 | 0.484 |
| 2.111150263212349 | 2.675 | 0.778 | 0.481 |
| 2.114291855865938 | 2.575 | 0.773 | 0.478 |
| 2.117433448519528 | 2.49 | 0.767 | 0.475 |
| 2.120575041173117 | 2.416 | 0.761 | 0.472 |
| 2.123716633826707 | 2.35 | 0.756 | 0.469 |
| 2.126858226480297 | 2.291 | 0.75 | 0.466 |
| 2.129999819133886 | 2.237 | 0.745 | 0.463 |
| 2.133141411787476 | 2.187 | 0.74 | 0.461 |
| 2.136283004441065 | 2.142 | 0.735 | 0.458 |
| 2.139424597094655 | 2.1 | 0.73 | 0.455 |
| 2.142566189748245 | 2.06 | 0.724 | 0.452 |
| 2.145707782401834 | 2.023 | 0.719 | 0.45 |
| 2.148849375055424 | 1.988 | 0.714 | 0.447 |
| 2.151990967709013 | 1.955 | 0.71 | 0.444 |
| 2.155132560362603 | 1.924 | 0.705 | 0.442 |
| 2.158274153016193 | 1.894 | 0.7 | 0.439 |
| 2.161415745669782 | 1.866 | 0.695 | 0.437 |
| 2.164557338323372 | 1.839 | 0.691 | 0.434 |
| 2.167698930976961 | 1.813 | 0.686 | 0.432 |
| 2.170840523630551 | 1.788 | 0.681 | 0.429 |
| 2.173982116284141 | 1.765 | 0.677 | 0.427 |
| 2.17712370893773 | 1.742 | 0.673 | 0.424 |
| 2.18026530159132 | 1.72 | 0.668 | 0.422 |
| 2.183406894244909 | 1.698 | 0.664 | 0.419 |
| 2.186548486898499 | 1.678 | 0.659 | 0.417 |
| 2.189690079552089 | 1.658 | 0.655 | 0.414 |
| 2.192831672205678 | 1.639 | 0.651 | 0.412 |
| 2.195973264859268 | 1.62 | 0.647 | 0.41 |
| 2.199114857512857 | 1.602 | 0.643 | 0.407 |
| 2.202256450166447 | 1.584 | 0.639 | 0.405 |
| 2.205398042820036 | 1.567 | 0.635 | 0.403 |
| 2.208539635473626 | 1.55 | 0.63 | 0.4 |
| 2.211681228127216 | 1.534 | 0.627 | 0.398 |
| 2.214822820780805 | 1.518 | 0.623 | 0.396 |
| 2.217964413434395 | 1.503 | 0.619 | 0.394 |
| 2.221106006087984 | 1.488 | 0.615 | 0.392 |
| 2.224247598741574 | 1.473 | 0.611 | 0.389 |
| 2.227389191395164 | 1.458 | 0.607 | 0.387 |
| 2.230530784048753 | 1.444 | 0.603 | 0.385 |
| 2.233672376702343 | 1.431 | 0.6 | 0.383 |
| 2.236813969355933 | 1.417 | 0.596 | 0.381 |
| 2.239955562009522 | 1.404 | 0.592 | 0.379 |
| 2.243097154663112 | 1.391 | 0.589 | 0.376 |
| 2.246238747316701 | 1.378 | 0.585 | 0.374 |
| 2.249380339970291 | 1.366 | 0.582 | 0.372 |
| 2.252521932623881 | 1.354 | 0.578 | 0.37 |
| 2.25566352527747 | 1.342 | 0.574 | 0.368 |
| 2.25880511793106 | 1.33 | 0.571 | 0.366 |
| 2.261946710584649 | 1.319 | 0.568 | 0.364 |
| 2.265088303238239 | 1.307 | 0.564 | 0.362 |
| 2.268229895891829 | 1.296 | 0.561 | 0.36 |
| 2.271371488545418 | 1.285 | 0.557 | 0.358 |
| 2.274513081199008 | 1.274 | 0.554 | 0.356 |
| 2.277654673852597 | 1.264 | 0.551 | 0.354 |
| 2.280796266506186 | 1.253 | 0.547 | 0.352 |
| 2.283937859159776 | 1.243 | 0.544 | 0.35 |
| 2.287079451813366 | 1.233 | 0.541 | 0.348 |
| 2.290221044466955 | 1.223 | 0.538 | 0.346 |
| 2.293362637120545 | 1.213 | 0.534 | 0.344 |
| 2.296504229774135 | 1.203 | 0.531 | 0.342 |
| 2.299645822427724 | 1.194 | 0.528 | 0.341 |
| 2.302787415081314 | 1.185 | 0.525 | 0.339 |
| 2.305929007734904 | 1.175 | 0.522 | 0.337 |
| 2.309070600388493 | 1.166 | 0.519 | 0.335 |
| 2.312212193042083 | 1.157 | 0.516 | 0.333 |
| 2.315353785695672 | 1.148 | 0.513 | 0.331 |
| 2.318495378349262 | 1.139 | 0.51 | 0.329 |
| 2.321636971002852 | 1.131 | 0.507 | 0.328 |
| 2.324778563656441 | 1.122 | 0.504 | 0.326 |
| 2.327920156310031 | 1.114 | 0.501 | 0.324 |
| 2.33106174896362 | 1.105 | 0.498 | 0.322 |
| 2.33420334161721 | 1.097 | 0.495 | 0.32 |
| 2.3373449342708 | 1.089 | 0.492 | 0.319 |
| 2.340486526924389 | 1.081 | 0.489 | 0.317 |
| 2.343628119577979 | 1.073 | 0.486 | 0.315 |
| 2.346769712231568 | 1.065 | 0.483 | 0.313 |
| 2.349911304885158 | 1.057 | 0.48 | 0.312 |
| 2.353052897538748 | 1.05 | 0.477 | 0.31 |
| 2.356194490192337 | 1.042 | 0.475 | 0.308 |
| 2.359336082845927 | 1.034 | 0.472 | 0.306 |
| 2.362477675499516 | 1.027 | 0.469 | 0.305 |
| 2.365619268153106 | 1.02 | 0.466 | 0.303 |
| 2.368760860806696 | 1.012 | 0.464 | 0.301 |
| 2.371902453460285 | 1.005 | 0.461 | 0.3 |
| 2.375044046113875 | 0.998 | 0.458 | 0.298 |
| 2.378185638767464 | 0.991 | 0.455 | 0.296 |
| 2.381327231421054 | 0.984 | 0.453 | 0.295 |
| 2.384468824074644 | 0.977 | 0.45 | 0.293 |
| 2.387610416728233 | 0.97 | 0.447 | 0.291 |
| 2.390752009381823 | 0.963 | 0.445 | 0.29 |
| 2.393893602035412 | 0.956 | 0.442 | 0.288 |
| 2.397035194689002 | 0.95 | 0.44 | 0.287 |
| 2.400176787342591 | 0.943 | 0.437 | 0.285 |
| 2.403318379996181 | 0.936 | 0.434 | 0.283 |
| 2.406459972649771 | 0.93 | 0.432 | 0.282 |
| 2.40960156530336 | 0.923 | 0.429 | 0.28 |
| 2.41274315795695 | 0.917 | 0.427 | 0.278 |
| 2.41588475061054 | 0.911 | 0.424 | 0.277 |
| 2.419026343264129 | 0.904 | 0.422 | 0.275 |
| 2.422167935917719 | 0.898 | 0.419 | 0.274 |
| 2.425309528571308 | 0.892 | 0.417 | 0.272 |
| 2.428451121224898 | 0.886 | 0.414 | 0.271 |
| 2.431592713878488 | 0.88 | 0.412 | 0.269 |
| 2.434734306532077 | 0.873 | 0.409 | 0.268 |
| 2.437875899185667 | 0.867 | 0.407 | 0.266 |
| 2.441017491839256 | 0.862 | 0.404 | 0.265 |
| 2.444159084492846 | 0.856 | 0.402 | 0.263 |
| 2.447300677146435 | 0.85 | 0.399 | 0.261 |
| 2.450442269800025 | 0.844 | 0.397 | 0.26 |
| 2.453583862453615 | 0.838 | 0.395 | 0.258 |
| 2.456725455107204 | 0.832 | 0.392 | 0.257 |
| 2.459867047760794 | 0.827 | 0.39 | 0.255 |
| 2.463008640414384 | 0.821 | 0.388 | 0.254 |
| 2.466150233067973 | 0.815 | 0.385 | 0.252 |
| 2.469291825721563 | 0.81 | 0.383 | 0.251 |
| 2.472433418375152 | 0.804 | 0.381 | 0.25 |
| 2.475575011028742 | 0.799 | 0.378 | 0.248 |
| 2.478716603682332 | 0.793 | 0.376 | 0.247 |
| 2.481858196335921 | 0.788 | 0.374 | 0.245 |
| 2.48499978898951 | 0.782 | 0.371 | 0.244 |
| 2.4881413816431 | 0.777 | 0.369 | 0.242 |
| 2.49128297429669 | 0.772 | 0.367 | 0.241 |
| 2.49442456695028 | 0.766 | 0.365 | 0.239 |
| 2.497566159603869 | 0.761 | 0.362 | 0.238 |
| 2.500707752257458 | 0.756 | 0.36 | 0.237 |
| 2.503849344911048 | 0.751 | 0.358 | 0.235 |
| 2.506990937564638 | 0.746 | 0.356 | 0.234 |
| 2.510132530218228 | 0.741 | 0.353 | 0.232 |
| 2.513274122871817 | 0.735 | 0.351 | 0.231 |
| 2.516415715525407 | 0.73 | 0.349 | 0.229 |
| 2.519557308178996 | 0.725 | 0.347 | 0.228 |
| 2.522698900832586 | 0.72 | 0.345 | 0.227 |
| 2.525840493486176 | 0.715 | 0.342 | 0.225 |
| 2.528982086139765 | 0.71 | 0.34 | 0.224 |
| 2.532123678793355 | 0.705 | 0.338 | 0.223 |
| 2.535265271446944 | 0.701 | 0.336 | 0.221 |
| 2.538406864100534 | 0.696 | 0.334 | 0.22 |
| 2.541548456754124 | 0.691 | 0.332 | 0.218 |
| 2.544690049407713 | 0.686 | 0.33 | 0.217 |
| 2.547831642061302 | 0.681 | 0.327 | 0.216 |
| 2.550973234714892 | 0.676 | 0.325 | 0.214 |
| 2.554114827368482 | 0.672 | 0.323 | 0.213 |
| 2.557256420022072 | 0.667 | 0.321 | 0.212 |
| 2.560398012675661 | 0.662 | 0.319 | 0.21 |
| 2.563539605329251 | 0.658 | 0.317 | 0.209 |
| 2.56668119798284 | 0.653 | 0.315 | 0.208 |
| 2.56982279063643 | 0.648 | 0.313 | 0.206 |
| 2.57296438329002 | 0.644 | 0.311 | 0.205 |
| 2.576105975943609 | 0.639 | 0.309 | 0.204 |
| 2.579247568597199 | 0.635 | 0.307 | 0.202 |
| 2.582389161250788 | 0.63 | 0.305 | 0.201 |
| 2.585530753904377 | 0.626 | 0.303 | 0.2 |
| 2.588672346557967 | 0.621 | 0.301 | 0.198 |
| 2.591813939211557 | 0.617 | 0.299 | 0.197 |
| 2.594955531865147 | 0.612 | 0.297 | 0.196 |
| 2.598097124518736 | 0.608 | 0.295 | 0.194 |
| 2.601238717172326 | 0.603 | 0.293 | 0.193 |
| 2.604380309825915 | 0.599 | 0.291 | 0.192 |
| 2.607521902479505 | 0.595 | 0.289 | 0.191 |
| 2.610663495133095 | 0.59 | 0.287 | 0.189 |
| 2.613805087786684 | 0.586 | 0.285 | 0.188 |
| 2.616946680440274 | 0.582 | 0.283 | 0.187 |
| 2.620088273093863 | 0.577 | 0.281 | 0.185 |
| 2.623229865747452 | 0.573 | 0.279 | 0.184 |
| 2.626371458401042 | 0.569 | 0.277 | 0.183 |
| 2.629513051054632 | 0.565 | 0.275 | 0.182 |
| 2.632654643708222 | 0.56 | 0.273 | 0.18 |
| 2.635796236361811 | 0.556 | 0.271 | 0.179 |
| 2.638937829015401 | 0.552 | 0.269 | 0.178 |
| 2.642079421668991 | 0.548 | 0.267 | 0.177 |
| 2.64522101432258 | 0.544 | 0.265 | 0.175 |
| 2.64836260697617 | 0.54 | 0.263 | 0.174 |
| 2.651504199629759 | 0.535 | 0.261 | 0.173 |
| 2.654645792283349 | 0.531 | 0.259 | 0.172 |
| 2.657787384936938 | 0.527 | 0.258 | 0.17 |
| 2.660928977590528 | 0.523 | 0.256 | 0.169 |
| 2.664070570244118 | 0.519 | 0.254 | 0.168 |
| 2.667212162897707 | 0.515 | 0.252 | 0.167 |
| 2.670353755551297 | 0.511 | 0.25 | 0.165 |
| 2.673495348204887 | 0.507 | 0.248 | 0.164 |
| 2.676636940858476 | 0.503 | 0.246 | 0.163 |
| 2.679778533512066 | 0.499 | 0.244 | 0.162 |
| 2.682920126165655 | 0.495 | 0.243 | 0.161 |
| 2.686061718819245 | 0.491 | 0.241 | 0.159 |
| 2.689203311472835 | 0.487 | 0.239 | 0.158 |
| 2.692344904126424 | 0.483 | 0.237 | 0.157 |
| 2.695486496780014 | 0.479 | 0.235 | 0.156 |
| 2.698628089433603 | 0.476 | 0.233 | 0.155 |
| 2.701769682087193 | 0.472 | 0.231 | 0.153 |
| 2.704911274740782 | 0.468 | 0.23 | 0.152 |
| 2.708052867394372 | 0.464 | 0.228 | 0.151 |
| 2.711194460047962 | 0.46 | 0.226 | 0.15 |
| 2.714336052701551 | 0.456 | 0.224 | 0.149 |
| 2.717477645355141 | 0.452 | 0.222 | 0.147 |
| 2.720619238008731 | 0.449 | 0.221 | 0.146 |
| 2.72376083066232 | 0.445 | 0.219 | 0.145 |
| 2.72690242331591 | 0.441 | 0.217 | 0.144 |
| 2.730044015969499 | 0.437 | 0.215 | 0.143 |
| 2.733185608623089 | 0.433 | 0.213 | 0.141 |
| 2.736327201276678 | 0.43 | 0.212 | 0.14 |
| 2.739468793930268 | 0.426 | 0.21 | 0.139 |
| 2.742610386583858 | 0.422 | 0.208 | 0.138 |
| 2.745751979237447 | 0.419 | 0.206 | 0.137 |
| 2.748893571891036 | 0.415 | 0.204 | 0.136 |
| 2.752035164544627 | 0.411 | 0.203 | 0.134 |
| 2.755176757198216 | 0.407 | 0.201 | 0.133 |
| 2.758318349851806 | 0.404 | 0.199 | 0.132 |
| 2.761459942505395 | 0.4 | 0.197 | 0.131 |
| 2.764601535158985 | 0.396 | 0.196 | 0.13 |
| 2.767743127812574 | 0.393 | 0.194 | 0.129 |
| 2.770884720466164 | 0.389 | 0.192 | 0.128 |
| 2.774026313119754 | 0.385 | 0.19 | 0.126 |
| 2.777167905773343 | 0.382 | 0.189 | 0.125 |
| 2.780309498426932 | 0.378 | 0.187 | 0.124 |
| 2.783451091080522 | 0.375 | 0.185 | 0.123 |
| 2.786592683734112 | 0.371 | 0.183 | 0.122 |
| 2.789734276387701 | 0.367 | 0.182 | 0.121 |
| 2.792875869041291 | 0.364 | 0.18 | 0.12 |
| 2.796017461694881 | 0.36 | 0.178 | 0.118 |
| 2.79915905434847 | 0.357 | 0.176 | 0.117 |
| 2.80230064700206 | 0.353 | 0.175 | 0.116 |
| 2.80544223965565 | 0.35 | 0.173 | 0.115 |
| 2.808583832309239 | 0.346 | 0.171 | 0.114 |
| 2.811725424962829 | 0.343 | 0.17 | 0.113 |
| 2.814867017616419 | 0.339 | 0.168 | 0.112 |
| 2.818008610270008 | 0.336 | 0.166 | 0.11 |
| 2.821150202923598 | 0.332 | 0.165 | 0.109 |
| 2.824291795577187 | 0.329 | 0.163 | 0.108 |
| 2.827433388230777 | 0.325 | 0.161 | 0.107 |
| 2.830574980884366 | 0.322 | 0.159 | 0.106 |
| 2.833716573537956 | 0.318 | 0.158 | 0.105 |
| 2.836858166191546 | 0.315 | 0.156 | 0.104 |
| 2.839999758845135 | 0.311 | 0.154 | 0.103 |
| 2.843141351498725 | 0.308 | 0.153 | 0.102 |
| 2.846282944152314 | 0.304 | 0.151 | 0.1 |
| 2.849424536805904 | 0.301 | 0.149 | 0.099 |
| 2.852566129459494 | 0.297 | 0.148 | 0.098 |
| 2.855707722113083 | 0.294 | 0.146 | 0.097 |
| 2.858849314766673 | 0.291 | 0.144 | 0.096 |
| 2.861990907420262 | 0.287 | 0.143 | 0.095 |
| 2.865132500073852 | 0.284 | 0.141 | 0.094 |
| 2.868274092727442 | 0.28 | 0.139 | 0.093 |
| 2.871415685381031 | 0.277 | 0.138 | 0.092 |
| 2.874557278034621 | 0.274 | 0.136 | 0.09 |
| 2.87769887068821 | 0.27 | 0.134 | 0.089 |
| 2.8808404633418 | 0.267 | 0.133 | 0.088 |
| 2.88398205599539 | 0.264 | 0.131 | 0.087 |
| 2.88712364864898 | 0.26 | 0.129 | 0.086 |
| 2.890265241302569 | 0.257 | 0.128 | 0.085 |
| 2.893406833956158 | 0.253 | 0.126 | 0.084 |
| 2.896548426609748 | 0.25 | 0.124 | 0.083 |
| 2.899690019263338 | 0.247 | 0.123 | 0.082 |
| 2.902831611916927 | 0.243 | 0.121 | 0.081 |
| 2.905973204570517 | 0.24 | 0.119 | 0.08 |
| 2.909114797224106 | 0.237 | 0.118 | 0.078 |
| 2.912256389877696 | 0.233 | 0.116 | 0.077 |
| 2.915397982531286 | 0.23 | 0.115 | 0.076 |
| 2.918539575184875 | 0.227 | 0.113 | 0.075 |
| 2.921681167838465 | 0.224 | 0.111 | 0.074 |
| 2.924822760492054 | 0.22 | 0.11 | 0.073 |
| 2.927964353145644 | 0.217 | 0.108 | 0.072 |
| 2.931105945799234 | 0.214 | 0.106 | 0.071 |
| 2.934247538452823 | 0.21 | 0.105 | 0.07 |
| 2.937389131106413 | 0.207 | 0.103 | 0.069 |
| 2.940530723760002 | 0.204 | 0.102 | 0.068 |
| 2.943672316413592 | 0.201 | 0.1 | 0.067 |
| 2.946813909067182 | 0.197 | 0.098 | 0.065 |
| 2.949955501720771 | 0.194 | 0.097 | 0.064 |
| 2.953097094374361 | 0.191 | 0.095 | 0.063 |
| 2.95623868702795 | 0.188 | 0.093 | 0.062 |
| 2.95938027968154 | 0.184 | 0.092 | 0.061 |
| 2.96252187233513 | 0.181 | 0.09 | 0.06 |
| 2.965663464988719 | 0.178 | 0.089 | 0.059 |
| 2.968805057642309 | 0.175 | 0.087 | 0.058 |
| 2.971946650295898 | 0.171 | 0.085 | 0.057 |
| 2.975088242949488 | 0.168 | 0.084 | 0.056 |
| 2.978229835603078 | 0.165 | 0.082 | 0.055 |
| 2.981371428256667 | 0.162 | 0.081 | 0.054 |
| 2.984513020910257 | 0.158 | 0.079 | 0.053 |
| 2.987654613563846 | 0.155 | 0.077 | 0.052 |
| 2.990796206217436 | 0.152 | 0.076 | 0.051 |
| 2.993937798871025 | 0.149 | 0.074 | 0.049 |
| 2.997079391524615 | 0.146 | 0.073 | 0.048 |
| 3.000220984178205 | 0.142 | 0.071 | 0.047 |
| 3.003362576831794 | 0.139 | 0.069 | 0.046 |
| 3.006504169485384 | 0.136 | 0.068 | 0.045 |
| 3.009645762138974 | 0.133 | 0.066 | 0.044 |
| 3.012787354792563 | 0.13 | 0.065 | 0.043 |
| 3.015928947446153 | 0.126 | 0.063 | 0.042 |
| 3.019070540099742 | 0.123 | 0.061 | 0.041 |
| 3.022212132753332 | 0.12 | 0.06 | 0.04 |
| 3.025353725406922 | 0.117 | 0.058 | 0.039 |
| 3.028495318060511 | 0.114 | 0.057 | 0.038 |
| 3.031636910714101 | 0.11 | 0.055 | 0.037 |
| 3.03477850336769 | 0.107 | 0.054 | 0.036 |
| 3.03792009602128 | 0.104 | 0.052 | 0.035 |
| 3.04106168867487 | 0.101 | 0.05 | 0.034 |
| 3.04420328132846 | 0.098 | 0.049 | 0.033 |
| 3.047344873982049 | 0.095 | 0.047 | 0.031 |
| 3.050486466635638 | 0.091 | 0.046 | 0.03 |
| 3.053628059289228 | 0.088 | 0.044 | 0.029 |
| 3.056769651942818 | 0.085 | 0.042 | 0.028 |
| 3.059911244596407 | 0.082 | 0.041 | 0.027 |
| 3.063052837249997 | 0.079 | 0.039 | 0.026 |
| 3.066194429903586 | 0.076 | 0.038 | 0.025 |
| 3.069336022557176 | 0.072 | 0.036 | 0.024 |
| 3.072477615210766 | 0.069 | 0.035 | 0.023 |
| 3.075619207864355 | 0.066 | 0.033 | 0.022 |
| 3.078760800517945 | 0.063 | 0.031 | 0.021 |
| 3.081902393171534 | 0.06 | 0.03 | 0.02 |
| 3.085043985825124 | 0.057 | 0.028 | 0.019 |
| 3.088185578478713 | 0.053 | 0.027 | 0.018 |
| 3.091327171132303 | 0.05 | 0.025 | 0.017 |
| 3.094468763785893 | 0.047 | 0.024 | 0.016 |
| 3.097610356439482 | 0.044 | 0.022 | 0.015 |
| 3.100751949093072 | 0.041 | 0.02 | 0.014 |
| 3.103893541746661 | 0.038 | 0.019 | 0.013 |
| 3.107035134400251 | 0.035 | 0.017 | 0.012 |
| 3.110176727053841 | 0.031 | 0.016 | 0.01 |
| 3.11331831970743 | 0.028 | 0.014 | 0.009 |
| 3.11645991236102 | 0.025 | 0.013 | 0.008 |
| 3.11960150501461 | 0.022 | 0.011 | 0.007 |
| 3.122743097668199 | 0.019 | 0.009 | 0.006 |
| 3.125884690321789 | 0.016 | 0.008 | 0.005 |
| 3.129026282975378 | 0.013 | 0.006 | 0.004 |
| 3.132167875628968 | 0.009 | 0.005 | 0.003 |
| 3.135309468282557 | 0.006 | 0.003 | 0.002 |
| 3.138451060936147 | 0.003 | 0.002 | 0.001 |
| 3.141592653589737 | 0 | 0 | 0 |
| 3.144734246243326 | -0.003 | -0.002 | -0.001 |
| 3.147875838896916 | -0.006 | -0.003 | -0.002 |
| 3.151017431550505 | -0.009 | -0.005 | -0.003 |
| 3.154159024204095 | -0.013 | -0.006 | -0.004 |
| 3.157300616857685 | -0.016 | -0.008 | -0.005 |
| 3.160442209511274 | -0.019 | -0.009 | -0.006 |
| 3.163583802164864 | -0.022 | -0.011 | -0.007 |
| 3.166725394818453 | -0.025 | -0.013 | -0.008 |
| 3.169866987472043 | -0.028 | -0.014 | -0.009 |
| 3.173008580125633 | -0.031 | -0.016 | -0.01 |
| 3.176150172779222 | -0.035 | -0.017 | -0.012 |
| 3.179291765432812 | -0.038 | -0.019 | -0.013 |
| 3.182433358086401 | -0.041 | -0.02 | -0.014 |
| 3.185574950739991 | -0.044 | -0.022 | -0.015 |
| 3.188716543393581 | -0.047 | -0.024 | -0.016 |
| 3.19185813604717 | -0.05 | -0.025 | -0.017 |
| 3.19499972870076 | -0.053 | -0.027 | -0.018 |
| 3.198141321354349 | -0.057 | -0.028 | -0.019 |
| 3.20128291400794 | -0.06 | -0.03 | -0.02 |
| 3.204424506661528 | -0.063 | -0.031 | -0.021 |
| 3.207566099315118 | -0.066 | -0.033 | -0.022 |
| 3.210707691968708 | -0.069 | -0.035 | -0.023 |
| 3.213849284622297 | -0.072 | -0.036 | -0.024 |
| 3.216990877275887 | -0.076 | -0.038 | -0.025 |
| 3.220132469929476 | -0.079 | -0.039 | -0.026 |
| 3.223274062583066 | -0.082 | -0.041 | -0.027 |
| 3.226415655236656 | -0.085 | -0.042 | -0.028 |
| 3.229557247890245 | -0.088 | -0.044 | -0.029 |
| 3.232698840543835 | -0.091 | -0.046 | -0.03 |
| 3.235840433197425 | -0.095 | -0.047 | -0.031 |
| 3.238982025851014 | -0.098 | -0.049 | -0.033 |
| 3.242123618504604 | -0.101 | -0.05 | -0.034 |
| 3.245265211158193 | -0.104 | -0.052 | -0.035 |
| 3.248406803811783 | -0.107 | -0.054 | -0.036 |
| 3.251548396465373 | -0.11 | -0.055 | -0.037 |
| 3.254689989118962 | -0.114 | -0.057 | -0.038 |
| 3.257831581772551 | -0.117 | -0.058 | -0.039 |
| 3.260973174426141 | -0.12 | -0.06 | -0.04 |
| 3.26411476707973 | -0.123 | -0.061 | -0.041 |
| 3.267256359733321 | -0.126 | -0.063 | -0.042 |
| 3.27039795238691 | -0.13 | -0.065 | -0.043 |
| 3.2735395450405 | -0.133 | -0.066 | -0.044 |
| 3.276681137694089 | -0.136 | -0.068 | -0.045 |
| 3.279822730347679 | -0.139 | -0.069 | -0.046 |
| 3.282964323001269 | -0.142 | -0.071 | -0.047 |
| 3.286105915654858 | -0.146 | -0.073 | -0.048 |
| 3.289247508308448 | -0.149 | -0.074 | -0.049 |
| 3.292389100962037 | -0.152 | -0.076 | -0.051 |
| 3.295530693615627 | -0.155 | -0.077 | -0.052 |
| 3.298672286269217 | -0.158 | -0.079 | -0.053 |
| 3.301813878922806 | -0.162 | -0.081 | -0.054 |
| 3.304955471576396 | -0.165 | -0.082 | -0.055 |
| 3.308097064229985 | -0.168 | -0.084 | -0.056 |
| 3.311238656883575 | -0.171 | -0.085 | -0.057 |
| 3.314380249537165 | -0.175 | -0.087 | -0.058 |
| 3.317521842190754 | -0.178 | -0.089 | -0.059 |
| 3.320663434844344 | -0.181 | -0.09 | -0.06 |
| 3.323805027497933 | -0.184 | -0.092 | -0.061 |
| 3.326946620151523 | -0.188 | -0.093 | -0.062 |
| 3.330088212805113 | -0.191 | -0.095 | -0.063 |
| 3.333229805458702 | -0.194 | -0.097 | -0.064 |
| 3.336371398112292 | -0.197 | -0.098 | -0.065 |
| 3.339512990765881 | -0.201 | -0.1 | -0.067 |
| 3.342654583419471 | -0.204 | -0.102 | -0.068 |
| 3.345796176073061 | -0.207 | -0.103 | -0.069 |
| 3.34893776872665 | -0.21 | -0.105 | -0.07 |
| 3.35207936138024 | -0.214 | -0.106 | -0.071 |
| 3.355220954033829 | -0.217 | -0.108 | -0.072 |
| 3.358362546687419 | -0.22 | -0.11 | -0.073 |
| 3.361504139341009 | -0.224 | -0.111 | -0.074 |
| 3.364645731994598 | -0.227 | -0.113 | -0.075 |
| 3.367787324648188 | -0.23 | -0.115 | -0.076 |
| 3.370928917301777 | -0.233 | -0.116 | -0.077 |
| 3.374070509955367 | -0.237 | -0.118 | -0.078 |
| 3.377212102608956 | -0.24 | -0.119 | -0.08 |
| 3.380353695262546 | -0.243 | -0.121 | -0.081 |
| 3.383495287916136 | -0.247 | -0.123 | -0.082 |
| 3.386636880569725 | -0.25 | -0.124 | -0.083 |
| 3.389778473223315 | -0.253 | -0.126 | -0.084 |
| 3.392920065876904 | -0.257 | -0.128 | -0.085 |
| 3.396061658530494 | -0.26 | -0.129 | -0.086 |
| 3.399203251184084 | -0.264 | -0.131 | -0.087 |
| 3.402344843837673 | -0.267 | -0.133 | -0.088 |
| 3.405486436491263 | -0.27 | -0.134 | -0.089 |
| 3.408628029144852 | -0.274 | -0.136 | -0.09 |
| 3.411769621798442 | -0.277 | -0.138 | -0.092 |
| 3.414911214452032 | -0.28 | -0.139 | -0.093 |
| 3.418052807105621 | -0.284 | -0.141 | -0.094 |
| 3.421194399759211 | -0.287 | -0.143 | -0.095 |
| 3.4243359924128 | -0.291 | -0.144 | -0.096 |
| 3.42747758506639 | -0.294 | -0.146 | -0.097 |
| 3.43061917771998 | -0.297 | -0.148 | -0.098 |
| 3.433760770373569 | -0.301 | -0.149 | -0.099 |
| 3.436902363027159 | -0.304 | -0.151 | -0.1 |
| 3.440043955680748 | -0.308 | -0.153 | -0.102 |
| 3.443185548334338 | -0.311 | -0.154 | -0.103 |
| 3.446327140987927 | -0.315 | -0.156 | -0.104 |
| 3.449468733641517 | -0.318 | -0.158 | -0.105 |
| 3.452610326295107 | -0.322 | -0.159 | -0.106 |
| 3.455751918948696 | -0.325 | -0.161 | -0.107 |
| 3.458893511602286 | -0.329 | -0.163 | -0.108 |
| 3.462035104255876 | -0.332 | -0.165 | -0.109 |
| 3.465176696909465 | -0.336 | -0.166 | -0.11 |
| 3.468318289563055 | -0.339 | -0.168 | -0.112 |
| 3.471459882216644 | -0.343 | -0.17 | -0.113 |
| 3.474601474870234 | -0.346 | -0.171 | -0.114 |
| 3.477743067523824 | -0.35 | -0.173 | -0.115 |
| 3.480884660177413 | -0.353 | -0.175 | -0.116 |
| 3.484026252831002 | -0.357 | -0.176 | -0.117 |
| 3.487167845484592 | -0.36 | -0.178 | -0.118 |
| 3.490309438138182 | -0.364 | -0.18 | -0.12 |
| 3.493451030791772 | -0.367 | -0.182 | -0.121 |
| 3.496592623445361 | -0.371 | -0.183 | -0.122 |
| 3.499734216098951 | -0.375 | -0.185 | -0.123 |
| 3.50287580875254 | -0.378 | -0.187 | -0.124 |
| 3.50601740140613 | -0.382 | -0.189 | -0.125 |
| 3.50915899405972 | -0.385 | -0.19 | -0.126 |
| 3.512300586713309 | -0.389 | -0.192 | -0.128 |
| 3.515442179366899 | -0.393 | -0.194 | -0.129 |
| 3.518583772020488 | -0.396 | -0.196 | -0.13 |
| 3.521725364674078 | -0.4 | -0.197 | -0.131 |
| 3.524866957327668 | -0.404 | -0.199 | -0.132 |
| 3.528008549981257 | -0.407 | -0.201 | -0.133 |
| 3.531150142634847 | -0.411 | -0.203 | -0.134 |
| 3.534291735288436 | -0.415 | -0.204 | -0.136 |
| 3.537433327942026 | -0.419 | -0.206 | -0.137 |
| 3.540574920595616 | -0.422 | -0.208 | -0.138 |
| 3.543716513249205 | -0.426 | -0.21 | -0.139 |
| 3.546858105902795 | -0.43 | -0.212 | -0.14 |
| 3.549999698556384 | -0.433 | -0.213 | -0.141 |
| 3.553141291209974 | -0.437 | -0.215 | -0.143 |
| 3.556282883863564 | -0.441 | -0.217 | -0.144 |
| 3.559424476517153 | -0.445 | -0.219 | -0.145 |
| 3.562566069170743 | -0.449 | -0.221 | -0.146 |
| 3.565707661824332 | -0.452 | -0.222 | -0.147 |
| 3.568849254477922 | -0.456 | -0.224 | -0.149 |
| 3.571990847131511 | -0.46 | -0.226 | -0.15 |
| 3.575132439785101 | -0.464 | -0.228 | -0.151 |
| 3.578274032438691 | -0.468 | -0.23 | -0.152 |
| 3.58141562509228 | -0.472 | -0.231 | -0.153 |
| 3.58455721774587 | -0.476 | -0.233 | -0.155 |
| 3.58769881039946 | -0.479 | -0.235 | -0.156 |
| 3.590840403053049 | -0.483 | -0.237 | -0.157 |
| 3.593981995706639 | -0.487 | -0.239 | -0.158 |
| 3.597123588360228 | -0.491 | -0.241 | -0.159 |
| 3.600265181013818 | -0.495 | -0.243 | -0.161 |
| 3.603406773667407 | -0.499 | -0.244 | -0.162 |
| 3.606548366320997 | -0.503 | -0.246 | -0.163 |
| 3.609689958974587 | -0.507 | -0.248 | -0.164 |
| 3.612831551628176 | -0.511 | -0.25 | -0.165 |
| 3.615973144281766 | -0.515 | -0.252 | -0.167 |
| 3.619114736935355 | -0.519 | -0.254 | -0.168 |
| 3.622256329588945 | -0.523 | -0.256 | -0.169 |
| 3.625397922242534 | -0.527 | -0.258 | -0.17 |
| 3.628539514896124 | -0.531 | -0.259 | -0.172 |
| 3.631681107549714 | -0.535 | -0.261 | -0.173 |
| 3.634822700203303 | -0.54 | -0.263 | -0.174 |
| 3.637964292856893 | -0.544 | -0.265 | -0.175 |
| 3.641105885510483 | -0.548 | -0.267 | -0.177 |
| 3.644247478164072 | -0.552 | -0.269 | -0.178 |
| 3.647389070817662 | -0.556 | -0.271 | -0.179 |
| 3.650530663471251 | -0.56 | -0.273 | -0.18 |
| 3.653672256124841 | -0.565 | -0.275 | -0.182 |
| 3.656813848778431 | -0.569 | -0.277 | -0.183 |
| 3.65995544143202 | -0.573 | -0.279 | -0.184 |
| 3.66309703408561 | -0.577 | -0.281 | -0.185 |
| 3.666238626739199 | -0.582 | -0.283 | -0.187 |
| 3.66938021939279 | -0.586 | -0.285 | -0.188 |
| 3.672521812046378 | -0.59 | -0.287 | -0.189 |
| 3.675663404699968 | -0.595 | -0.289 | -0.191 |
| 3.678804997353558 | -0.599 | -0.291 | -0.192 |
| 3.681946590007147 | -0.603 | -0.293 | -0.193 |
| 3.685088182660737 | -0.608 | -0.295 | -0.194 |
| 3.688229775314326 | -0.612 | -0.297 | -0.196 |
| 3.691371367967916 | -0.617 | -0.299 | -0.197 |
| 3.694512960621506 | -0.621 | -0.301 | -0.198 |
| 3.697654553275095 | -0.626 | -0.303 | -0.2 |
| 3.700796145928685 | -0.63 | -0.305 | -0.201 |
| 3.703937738582274 | -0.635 | -0.307 | -0.202 |
| 3.707079331235864 | -0.639 | -0.309 | -0.204 |
| 3.710220923889454 | -0.644 | -0.311 | -0.205 |
| 3.713362516543043 | -0.648 | -0.313 | -0.206 |
| 3.716504109196633 | -0.653 | -0.315 | -0.208 |
| 3.719645701850223 | -0.658 | -0.317 | -0.209 |
| 3.722787294503812 | -0.662 | -0.319 | -0.21 |
| 3.725928887157402 | -0.667 | -0.321 | -0.212 |
| 3.729070479810991 | -0.672 | -0.323 | -0.213 |
| 3.732212072464581 | -0.676 | -0.325 | -0.214 |
| 3.735353665118171 | -0.681 | -0.327 | -0.216 |
| 3.73849525777176 | -0.686 | -0.33 | -0.217 |
| 3.74163685042535 | -0.691 | -0.332 | -0.218 |
| 3.744778443078939 | -0.696 | -0.334 | -0.22 |
| 3.747920035732529 | -0.701 | -0.336 | -0.221 |
| 3.751061628386119 | -0.705 | -0.338 | -0.223 |
| 3.754203221039708 | -0.71 | -0.34 | -0.224 |
| 3.757344813693298 | -0.715 | -0.342 | -0.225 |
| 3.760486406346887 | -0.72 | -0.345 | -0.227 |
| 3.763627999000477 | -0.725 | -0.347 | -0.228 |
| 3.766769591654067 | -0.73 | -0.349 | -0.229 |
| 3.769911184307656 | -0.735 | -0.351 | -0.231 |
| 3.773052776961246 | -0.741 | -0.353 | -0.232 |
| 3.776194369614835 | -0.746 | -0.356 | -0.234 |
| 3.779335962268425 | -0.751 | -0.358 | -0.235 |
| 3.782477554922014 | -0.756 | -0.36 | -0.237 |
| 3.785619147575604 | -0.761 | -0.362 | -0.238 |
| 3.788760740229193 | -0.766 | -0.365 | -0.239 |
| 3.791902332882783 | -0.772 | -0.367 | -0.241 |
| 3.795043925536373 | -0.777 | -0.369 | -0.242 |
| 3.798185518189962 | -0.782 | -0.371 | -0.244 |
| 3.801327110843552 | -0.788 | -0.374 | -0.245 |
| 3.804468703497142 | -0.793 | -0.376 | -0.247 |
| 3.807610296150731 | -0.799 | -0.378 | -0.248 |
| 3.810751888804321 | -0.804 | -0.381 | -0.25 |
| 3.813893481457911 | -0.81 | -0.383 | -0.251 |
| 3.8170350741115 | -0.815 | -0.385 | -0.252 |
| 3.82017666676509 | -0.821 | -0.388 | -0.254 |
| 3.823318259418679 | -0.827 | -0.39 | -0.255 |
| 3.826459852072269 | -0.832 | -0.392 | -0.257 |
| 3.829601444725859 | -0.838 | -0.395 | -0.258 |
| 3.832743037379448 | -0.844 | -0.397 | -0.26 |
| 3.835884630033038 | -0.85 | -0.399 | -0.261 |
| 3.839026222686627 | -0.856 | -0.402 | -0.263 |
| 3.842167815340217 | -0.862 | -0.404 | -0.265 |
| 3.845309407993807 | -0.867 | -0.407 | -0.266 |
| 3.848451000647396 | -0.873 | -0.409 | -0.268 |
| 3.851592593300986 | -0.88 | -0.412 | -0.269 |
| 3.854734185954575 | -0.886 | -0.414 | -0.271 |
| 3.857875778608165 | -0.892 | -0.417 | -0.272 |
| 3.861017371261755 | -0.898 | -0.419 | -0.274 |
| 3.864158963915344 | -0.904 | -0.422 | -0.275 |
| 3.867300556568933 | -0.911 | -0.424 | -0.277 |
| 3.870442149222523 | -0.917 | -0.427 | -0.278 |
| 3.873583741876112 | -0.923 | -0.429 | -0.28 |
| 3.876725334529703 | -0.93 | -0.432 | -0.282 |
| 3.879866927183292 | -0.936 | -0.434 | -0.283 |
| 3.883008519836882 | -0.943 | -0.437 | -0.285 |
| 3.886150112490471 | -0.95 | -0.44 | -0.287 |
| 3.889291705144061 | -0.956 | -0.442 | -0.288 |
| 3.892433297797651 | -0.963 | -0.445 | -0.29 |
| 3.89557489045124 | -0.97 | -0.447 | -0.291 |
| 3.89871648310483 | -0.977 | -0.45 | -0.293 |
| 3.901858075758419 | -0.984 | -0.453 | -0.295 |
| 3.904999668412009 | -0.991 | -0.455 | -0.296 |
| 3.908141261065598 | -0.998 | -0.458 | -0.298 |
| 3.911282853719188 | -1.005 | -0.461 | -0.3 |
| 3.914424446372778 | -1.012 | -0.464 | -0.301 |
| 3.917566039026367 | -1.02 | -0.466 | -0.303 |
| 3.920707631679957 | -1.027 | -0.469 | -0.305 |
| 3.923849224333547 | -1.034 | -0.472 | -0.306 |
| 3.926990816987136 | -1.042 | -0.475 | -0.308 |
| 3.930132409640726 | -1.05 | -0.477 | -0.31 |
| 3.933274002294315 | -1.057 | -0.48 | -0.312 |
| 3.936415594947905 | -1.065 | -0.483 | -0.313 |
| 3.939557187601495 | -1.073 | -0.486 | -0.315 |
| 3.942698780255084 | -1.081 | -0.489 | -0.317 |
| 3.945840372908674 | -1.089 | -0.492 | -0.319 |
| 3.948981965562263 | -1.097 | -0.495 | -0.32 |
| 3.952123558215853 | -1.105 | -0.498 | -0.322 |
| 3.955265150869442 | -1.114 | -0.501 | -0.324 |
| 3.958406743523032 | -1.122 | -0.504 | -0.326 |
| 3.961548336176622 | -1.131 | -0.507 | -0.328 |
| 3.964689928830211 | -1.139 | -0.51 | -0.329 |
| 3.967831521483801 | -1.148 | -0.513 | -0.331 |
| 3.97097311413739 | -1.157 | -0.516 | -0.333 |
| 3.97411470679098 | -1.166 | -0.519 | -0.335 |
| 3.97725629944457 | -1.175 | -0.522 | -0.337 |
| 3.98039789209816 | -1.185 | -0.525 | -0.339 |
| 3.983539484751749 | -1.194 | -0.528 | -0.341 |
| 3.986681077405338 | -1.203 | -0.531 | -0.342 |
| 3.989822670058928 | -1.213 | -0.534 | -0.344 |
| 3.992964262712517 | -1.223 | -0.538 | -0.346 |
| 3.996105855366107 | -1.233 | -0.541 | -0.348 |
| 3.999247448019697 | -1.243 | -0.544 | -0.35 |
| 4.002389040673287 | -1.253 | -0.547 | -0.352 |
| 4.005530633326877 | -1.264 | -0.551 | -0.354 |
| 4.008672225980466 | -1.274 | -0.554 | -0.356 |
| 4.011813818634056 | -1.285 | -0.557 | -0.358 |
| 4.014955411287645 | -1.296 | -0.561 | -0.36 |
| 4.018097003941234 | -1.307 | -0.564 | -0.362 |
| 4.021238596594824 | -1.319 | -0.568 | -0.364 |
| 4.024380189248414 | -1.33 | -0.571 | -0.366 |
| 4.027521781902004 | -1.342 | -0.574 | -0.368 |
| 4.030663374555593 | -1.354 | -0.578 | -0.37 |
| 4.033804967209183 | -1.366 | -0.582 | -0.372 |
| 4.036946559862773 | -1.378 | -0.585 | -0.374 |
| 4.040088152516362 | -1.391 | -0.589 | -0.376 |
| 4.043229745169951 | -1.404 | -0.592 | -0.379 |
| 4.046371337823541 | -1.417 | -0.596 | -0.381 |
| 4.049512930477131 | -1.431 | -0.6 | -0.383 |
| 4.05265452313072 | -1.444 | -0.603 | -0.385 |
| 4.05579611578431 | -1.458 | -0.607 | -0.387 |
| 4.0589377084379 | -1.473 | -0.611 | -0.389 |
| 4.062079301091489 | -1.488 | -0.615 | -0.392 |
| 4.065220893745079 | -1.503 | -0.619 | -0.394 |
| 4.068362486398668 | -1.518 | -0.623 | -0.396 |
| 4.071504079052258 | -1.534 | -0.627 | -0.398 |
| 4.074645671705848 | -1.55 | -0.63 | -0.4 |
| 4.077787264359437 | -1.567 | -0.635 | -0.403 |
| 4.080928857013027 | -1.584 | -0.639 | -0.405 |
| 4.084070449666616 | -1.602 | -0.643 | -0.407 |
| 4.087212042320206 | -1.62 | -0.647 | -0.41 |
| 4.090353634973795 | -1.639 | -0.651 | -0.412 |
| 4.093495227627385 | -1.658 | -0.655 | -0.414 |
| 4.096636820280975 | -1.678 | -0.659 | -0.417 |
| 4.099778412934564 | -1.698 | -0.664 | -0.419 |
| 4.102920005588154 | -1.72 | -0.668 | -0.422 |
| 4.106061598241744 | -1.742 | -0.673 | -0.424 |
| 4.109203190895333 | -1.765 | -0.677 | -0.427 |
| 4.112344783548923 | -1.788 | -0.681 | -0.429 |
| 4.115486376202512 | -1.813 | -0.686 | -0.432 |
| 4.118627968856102 | -1.839 | -0.691 | -0.434 |
| 4.121769561509692 | -1.866 | -0.695 | -0.437 |
| 4.124911154163281 | -1.894 | -0.7 | -0.439 |
| 4.128052746816871 | -1.924 | -0.705 | -0.442 |
| 4.13119433947046 | -1.955 | -0.71 | -0.444 |
| 4.13433593212405 | -1.988 | -0.714 | -0.447 |
| 4.13747752477764 | -2.023 | -0.719 | -0.45 |
| 4.14061911743123 | -2.06 | -0.724 | -0.452 |
| 4.143760710084818 | -2.1 | -0.73 | -0.455 |
| 4.146902302738408 | -2.142 | -0.735 | -0.458 |
| 4.150043895391998 | -2.187 | -0.74 | -0.461 |
| 4.153185488045588 | -2.237 | -0.745 | -0.463 |
| 4.156327080699177 | -2.291 | -0.75 | -0.466 |
| 4.159468673352766 | -2.35 | -0.756 | -0.469 |
| 4.162610266006356 | -2.416 | -0.761 | -0.472 |
| 4.165751858659946 | -2.49 | -0.767 | -0.475 |
| 4.168893451313535 | -2.575 | -0.773 | -0.478 |
| 4.172035043967125 | -2.675 | -0.778 | -0.481 |
| 4.175176636620715 | -2.796 | -0.784 | -0.484 |
| 4.178318229274304 | -2.948 | -0.79 | -0.487 |
| 4.181459821927894 | -3.154 | -0.796 | -0.49 |
| 4.184601414581484 | -3.478 | -0.802 | -0.493 |
| 4.187743007235073 | -4.279 | -0.808 | -0.496 |
| 4.190884599888663 | -3.879 | -0.815 | -0.499 |
| 4.194026192542252 | -3.35 | -0.821 | -0.502 |
| 4.197167785195842 | -3.08 | -0.828 | -0.505 |
| 4.200309377849432 | -2.896 | -0.834 | -0.509 |
| 4.203450970503021 | -2.757 | -0.841 | -0.512 |
| 4.206592563156611 | -2.646 | -0.848 | -0.515 |
| 4.2097341558102 | -2.553 | -0.855 | -0.519 |
| 4.21287574846379 | -2.472 | -0.862 | -0.522 |
| 4.21601734111738 | -2.402 | -0.869 | -0.526 |
| 4.21915893377097 | -2.34 | -0.877 | -0.529 |
| 4.222300526424559 | -2.283 | -0.884 | -0.533 |
| 4.225442119078148 | -2.232 | -0.892 | -0.536 |
| 4.228583711731738 | -2.185 | -0.9 | -0.54 |
| 4.231725304385327 | -2.142 | -0.908 | -0.544 |
| 4.234866897038917 | -2.101 | -0.916 | -0.547 |
| 4.238008489692506 | -2.064 | -0.924 | -0.551 |
| 4.241150082346096 | -2.029 | -0.933 | -0.555 |
| 4.244291674999685 | -1.995 | -0.942 | -0.559 |
| 4.247433267653276 | -1.964 | -0.951 | -0.563 |
| 4.250574860306865 | -1.935 | -0.96 | -0.567 |
| 4.253716452960455 | -1.906 | -0.969 | -0.571 |
| 4.256858045614044 | -1.88 | -0.979 | -0.575 |
| 4.259999638267634 | -1.854 | -0.989 | -0.579 |
| 4.263141230921224 | -1.83 | -0.999 | -0.583 |
| 4.266282823574813 | -1.806 | -1.01 | -0.587 |
| 4.269424416228403 | -1.784 | -1.021 | -0.592 |
| 4.272566008881992 | -1.762 | -1.032 | -0.596 |
| 4.275707601535582 | -1.741 | -1.043 | -0.601 |
| 4.27884919418917 | -1.721 | -1.055 | -0.605 |
| 4.28199078684276 | -1.702 | -1.067 | -0.61 |
| 4.285132379496351 | -1.683 | -1.08 | -0.615 |
| 4.28827397214994 | -1.665 | -1.093 | -0.62 |
| 4.29141556480353 | -1.648 | -1.107 | -0.624 |
| 4.294557157457119 | -1.631 | -1.121 | -0.629 |
| 4.29769875011071 | -1.615 | -1.136 | -0.635 |
| 4.300840342764299 | -1.599 | -1.151 | -0.64 |
| 4.303981935417888 | -1.583 | -1.167 | -0.645 |
| 4.307123528071478 | -1.568 | -1.184 | -0.65 |
| 4.310265120725067 | -1.553 | -1.202 | -0.656 |
| 4.313406713378657 | -1.539 | -1.22 | -0.662 |
| 4.316548306032247 | -1.525 | -1.24 | -0.667 |
| 4.319689898685836 | -1.512 | -1.26 | -0.673 |
| 4.322831491339426 | -1.498 | -1.282 | -0.679 |
| 4.325973083993015 | -1.486 | -1.305 | -0.685 |
| 4.329114676646605 | -1.473 | -1.33 | -0.691 |
| 4.332256269300195 | -1.461 | -1.357 | -0.698 |
| 4.335397861953784 | -1.449 | -1.386 | -0.704 |
| 4.338539454607374 | -1.437 | -1.417 | -0.711 |
| 4.341681047260963 | -1.425 | -1.452 | -0.718 |
| 4.344822639914553 | -1.414 | -1.49 | -0.725 |
| 4.347964232568143 | -1.403 | -1.533 | -0.732 |
| 4.351105825221732 | -1.392 | -1.581 | -0.74 |
| 4.354247417875322 | -1.381 | -1.638 | -0.748 |
| 4.357389010528911 | -1.371 | -1.704 | -0.756 |
| 4.360530603182501 | -1.361 | -1.787 | -0.764 |
| 4.36367219583609 | -1.351 | -1.894 | -0.772 |
| 4.36681378848968 | -1.341 | -2.048 | -0.781 |
| 4.36995538114327 | -1.331 | -2.329 | -0.79 |
| 4.373096973796859 | -1.322 | -2.881 | -0.799 |
| 4.376238566450449 | -1.313 | -2.205 | -0.809 |
| 4.379380159104038 | -1.303 | -1.988 | -0.819 |
| 4.382521751757628 | -1.294 | -1.854 | -0.829 |
| 4.385663344411217 | -1.286 | -1.757 | -0.84 |
| 4.388804937064807 | -1.277 | -1.682 | -0.851 |
| 4.391946529718397 | -1.268 | -1.619 | -0.863 |
| 4.395088122371987 | -1.26 | -1.567 | -0.876 |
| 4.398229715025576 | -1.252 | -1.521 | -0.889 |
| 4.401371307679165 | -1.243 | -1.48 | -0.902 |
| 4.404512900332755 | -1.235 | -1.444 | -0.917 |
| 4.407654492986345 | -1.228 | -1.411 | -0.932 |
| 4.410796085639934 | -1.22 | -1.38 | -0.948 |
| 4.413937678293524 | -1.212 | -1.353 | -0.965 |
| 4.417079270947114 | -1.204 | -1.327 | -0.984 |
| 4.420220863600703 | -1.197 | -1.303 | -1.004 |
| 4.423362456254293 | -1.19 | -1.281 | -1.025 |
| 4.426504048907883 | -1.182 | -1.26 | -1.049 |
| 4.429645641561472 | -1.175 | -1.24 | -1.074 |
| 4.432787234215062 | -1.168 | -1.221 | -1.103 |
| 4.435928826868651 | -1.161 | -1.203 | -1.135 |
| 4.43907041952224 | -1.154 | -1.186 | -1.172 |
| 4.44221201217583 | -1.148 | -1.17 | -1.215 |
| 4.44535360482942 | -1.141 | -1.155 | -1.266 |
| 4.44849519748301 | -1.134 | -1.14 | -1.33 |
| 4.4516367901366 | -1.128 | -1.126 | -1.415 |
| 4.454778382790188 | -1.121 | -1.112 | -1.542 |
| 4.457919975443779 | -1.115 | -1.099 | -1.804 |
| 4.461061568097368 | -1.109 | -1.087 | -2.1 |
| 4.464203160750958 | -1.102 | -1.075 | -1.566 |
| 4.467344753404547 | -1.096 | -1.063 | -1.43 |
| 4.470486346058137 | -1.09 | -1.052 | -1.341 |
| 4.473627938711726 | -1.084 | -1.041 | -1.275 |
| 4.476769531365316 | -1.078 | -1.03 | -1.222 |
| 4.479911124018905 | -1.072 | -1.02 | -1.179 |
| 4.483052716672495 | -1.067 | -1.01 | -1.142 |
| 4.486194309326085 | -1.061 | -1 | -1.109 |
| 4.489335901979674 | -1.055 | -0.99 | -1.08 |
| 4.492477494633264 | -1.05 | -0.981 | -1.054 |
| 4.495619087286854 | -1.044 | -0.972 | -1.031 |
| 4.498760679940443 | -1.039 | -0.963 | -1.009 |
| 4.501902272594033 | -1.033 | -0.955 | -0.989 |
| 4.505043865247622 | -1.028 | -0.947 | -0.971 |
| 4.508185457901212 | -1.022 | -0.938 | -0.954 |
| 4.511327050554801 | -1.017 | -0.93 | -0.938 |
| 4.514468643208391 | -1.012 | -0.923 | -0.922 |
| 4.517610235861981 | -1.007 | -0.915 | -0.908 |
| 4.520751828515571 | -1.002 | -0.908 | -0.895 |
| 4.52389342116916 | -0.997 | -0.901 | -0.882 |
| 4.52703501382275 | -0.992 | -0.893 | -0.869 |
| 4.530176606476339 | -0.987 | -0.886 | -0.858 |
| 4.533318199129928 | -0.982 | -0.88 | -0.847 |
| 4.536459791783518 | -0.977 | -0.873 | -0.836 |
| 4.539601384437108 | -0.972 | -0.866 | -0.826 |
| 4.542742977090698 | -0.967 | -0.86 | -0.816 |
| 4.545884569744287 | -0.963 | -0.854 | -0.806 |
| 4.549026162397876 | -0.958 | -0.847 | -0.797 |
| 4.552167755051466 | -0.953 | -0.841 | -0.788 |
| 4.555309347705056 | -0.949 | -0.835 | -0.78 |
| 4.558450940358646 | -0.944 | -0.83 | -0.771 |
| 4.561592533012235 | -0.94 | -0.824 | -0.763 |
| 4.564734125665825 | -0.935 | -0.818 | -0.756 |
| 4.567875718319415 | -0.931 | -0.813 | -0.748 |
| 4.571017310973004 | -0.926 | -0.807 | -0.741 |
| 4.574158903626594 | -0.922 | -0.802 | -0.734 |
| 4.577300496280183 | -0.918 | -0.796 | -0.727 |
| 4.580442088933772 | -0.913 | -0.791 | -0.72 |
| 4.583583681587362 | -0.909 | -0.786 | -0.714 |
| 4.586725274240952 | -0.905 | -0.781 | -0.707 |
| 4.589866866894542 | -0.901 | -0.776 | -0.701 |
| 4.593008459548131 | -0.897 | -0.771 | -0.695 |
| 4.596150052201721 | -0.893 | -0.766 | -0.689 |
| 4.59929164485531 | -0.889 | -0.761 | -0.683 |
| 4.6024332375089 | -0.885 | -0.757 | -0.678 |
| 4.60557483016249 | -0.88 | -0.752 | -0.672 |
| 4.608716422816079 | -0.877 | -0.747 | -0.667 |
| 4.611858015469668 | -0.873 | -0.743 | -0.661 |
| 4.614999608123258 | -0.869 | -0.738 | -0.656 |
| 4.618141200776848 | -0.865 | -0.734 | -0.651 |
| 4.621282793430437 | -0.861 | -0.73 | -0.646 |
| 4.624424386084027 | -0.857 | -0.725 | -0.641 |
| 4.627565978737617 | -0.853 | -0.721 | -0.636 |
| 4.630707571391206 | -0.85 | -0.717 | -0.632 |
| 4.633849164044795 | -0.846 | -0.713 | -0.627 |
| 4.636990756698386 | -0.842 | -0.709 | -0.623 |
| 4.640132349351975 | -0.838 | -0.705 | -0.618 |
| 4.643273942005564 | -0.835 | -0.701 | -0.614 |
| 4.646415534659154 | -0.831 | -0.697 | -0.609 |
| 4.649557127312744 | -0.827 | -0.693 | -0.605 |
| 4.652698719966334 | -0.824 | -0.689 | -0.601 |
| 4.655840312619923 | -0.82 | -0.685 | -0.597 |
| 4.658981905273513 | -0.817 | -0.681 | -0.593 |
| 4.662123497927102 | -0.813 | -0.678 | -0.589 |
| 4.665265090580692 | -0.81 | -0.674 | -0.585 |
| 4.668406683234282 | -0.806 | -0.67 | -0.581 |
| 4.671548275887871 | -0.803 | -0.667 | -0.577 |
| 4.674689868541461 | -0.8 | -0.663 | -0.574 |
| 4.67783146119505 | -0.796 | -0.66 | -0.57 |
| 4.68097305384864 | -0.793 | -0.656 | -0.566 |
| 4.68411464650223 | -0.789 | -0.653 | -0.563 |
| 4.687256239155819 | -0.786 | -0.649 | -0.559 |
| 4.690397831809409 | -0.783 | -0.646 | -0.556 |
| 4.693539424462998 | -0.78 | -0.643 | -0.552 |
| 4.696681017116588 | -0.776 | -0.639 | -0.549 |
| 4.699822609770177 | -0.773 | -0.636 | -0.546 |
| 4.702964202423767 | -0.77 | -0.633 | -0.542 |
| 4.706105795077356 | -0.767 | -0.63 | -0.539 |
| 4.709247387730946 | -0.763 | -0.626 | -0.536 |
| 4.712388980384535 | -0.76 | -0.623 | -0.533 |
| 4.715530573038126 | -0.757 | -0.62 | -0.53 |
| 4.718672165691715 | -0.754 | -0.617 | -0.527 |
| 4.721813758345305 | -0.751 | -0.614 | -0.524 |
| 4.724955350998894 | -0.748 | -0.611 | -0.521 |
| 4.728096943652484 | -0.745 | -0.608 | -0.518 |
| 4.731238536306074 | -0.742 | -0.605 | -0.515 |
| 4.734380128959663 | -0.739 | -0.602 | -0.512 |
| 4.737521721613253 | -0.736 | -0.599 | -0.509 |
| 4.740663314266842 | -0.733 | -0.596 | -0.506 |
| 4.743804906920432 | -0.73 | -0.593 | -0.503 |
| 4.74694649957402 | -0.727 | -0.59 | -0.5 |
| 4.750088092227611 | -0.724 | -0.588 | -0.498 |
| 4.7532296848812 | -0.721 | -0.585 | -0.495 |
| 4.75637127753479 | -0.718 | -0.582 | -0.492 |
| 4.75951287018838 | -0.715 | -0.579 | -0.49 |
| 4.76265446284197 | -0.712 | -0.576 | -0.487 |
| 4.765796055495559 | -0.71 | -0.574 | -0.484 |
| 4.768937648149149 | -0.707 | -0.571 | -0.482 |
| 4.772079240802738 | -0.704 | -0.568 | -0.479 |
| 4.775220833456327 | -0.701 | -0.566 | -0.477 |
| 4.778362426109917 | -0.698 | -0.563 | -0.474 |
| 4.781504018763507 | -0.696 | -0.56 | -0.472 |
| 4.784645611417097 | -0.693 | -0.558 | -0.469 |
| 4.787787204070686 | -0.69 | -0.555 | -0.467 |
| 4.790928796724275 | -0.687 | -0.553 | -0.464 |
| 4.794070389377865 | -0.685 | -0.55 | -0.462 |
| 4.797211982031455 | -0.682 | -0.548 | -0.46 |
| 4.800353574685045 | -0.679 | -0.545 | -0.457 |
| 4.803495167338634 | -0.677 | -0.543 | -0.455 |
| 4.806636759992224 | -0.674 | -0.54 | -0.453 |
| 4.809778352645814 | -0.671 | -0.538 | -0.451 |
| 4.812919945299403 | -0.669 | -0.535 | -0.448 |
| 4.816061537952993 | -0.666 | -0.533 | -0.446 |
| 4.819203130606582 | -0.664 | -0.531 | -0.444 |
| 4.822344723260172 | -0.661 | -0.528 | -0.442 |
| 4.825486315913761 | -0.658 | -0.526 | -0.439 |
| 4.828627908567351 | -0.656 | -0.523 | -0.437 |
| 4.83176950122094 | -0.653 | -0.521 | -0.435 |
| 4.83491109387453 | -0.651 | -0.519 | -0.433 |
| 4.83805268652812 | -0.648 | -0.517 | -0.431 |
| 4.841194279181709 | -0.646 | -0.514 | -0.429 |
| 4.844335871835299 | -0.643 | -0.512 | -0.427 |
| 4.847477464488889 | -0.641 | -0.51 | -0.425 |
| 4.850619057142478 | -0.638 | -0.508 | -0.423 |
| 4.853760649796068 | -0.636 | -0.505 | -0.421 |
| 4.856902242449657 | -0.633 | -0.503 | -0.419 |
| 4.860043835103247 | -0.631 | -0.501 | -0.417 |
| 4.863185427756837 | -0.629 | -0.499 | -0.415 |
| 4.866327020410426 | -0.626 | -0.497 | -0.413 |
| 4.869468613064015 | -0.624 | -0.494 | -0.411 |
| 4.872610205717605 | -0.621 | -0.492 | -0.409 |
| 4.875751798371195 | -0.619 | -0.49 | -0.407 |
| 4.878893391024784 | -0.617 | -0.488 | -0.405 |
| 4.882034983678374 | -0.614 | -0.486 | -0.403 |
| 4.885176576331964 | -0.612 | -0.484 | -0.401 |
| 4.888318168985553 | -0.61 | -0.482 | -0.4 |
| 4.891459761639143 | -0.607 | -0.48 | -0.398 |
| 4.894601354292733 | -0.605 | -0.478 | -0.396 |
| 4.897742946946322 | -0.603 | -0.476 | -0.394 |
| 4.900884539599912 | -0.6 | -0.474 | -0.392 |
| 4.904026132253501 | -0.598 | -0.472 | -0.39 |
| 4.907167724907091 | -0.596 | -0.47 | -0.389 |
| 4.91030931756068 | -0.594 | -0.468 | -0.387 |
| 4.91345091021427 | -0.591 | -0.466 | -0.385 |
| 4.91659250286786 | -0.589 | -0.464 | -0.383 |
| 4.91973409552145 | -0.587 | -0.462 | -0.382 |
| 4.922875688175039 | -0.585 | -0.46 | -0.38 |
| 4.926017280828628 | -0.582 | -0.458 | -0.378 |
| 4.929158873482218 | -0.58 | -0.456 | -0.377 |
| 4.932300466135808 | -0.578 | -0.454 | -0.375 |
| 4.935442058789397 | -0.576 | -0.452 | -0.373 |
| 4.938583651442987 | -0.574 | -0.45 | -0.372 |
| 4.941725244096576 | -0.571 | -0.449 | -0.37 |
| 4.944866836750166 | -0.569 | -0.447 | -0.368 |
| 4.948008429403755 | -0.567 | -0.445 | -0.367 |
| 4.951150022057345 | -0.565 | -0.443 | -0.365 |
| 4.954291614710935 | -0.563 | -0.441 | -0.363 |
| 4.957433207364524 | -0.561 | -0.439 | -0.362 |
| 4.960574800018114 | -0.559 | -0.438 | -0.36 |
| 4.963716392671704 | -0.557 | -0.436 | -0.359 |
| 4.966857985325293 | -0.554 | -0.434 | -0.357 |
| 4.969999577978883 | -0.552 | -0.432 | -0.355 |
| 4.973141170632472 | -0.55 | -0.43 | -0.354 |
| 4.976282763286062 | -0.548 | -0.429 | -0.352 |
| 4.979424355939651 | -0.546 | -0.427 | -0.351 |
| 4.982565948593241 | -0.544 | -0.425 | -0.349 |
| 4.985707541246831 | -0.542 | -0.423 | -0.348 |
| 4.98884913390042 | -0.54 | -0.422 | -0.346 |
| 4.99199072655401 | -0.538 | -0.42 | -0.345 |
| 4.9951323192076 | -0.536 | -0.418 | -0.343 |
| 4.99827391186119 | -0.534 | -0.416 | -0.342 |
| 5.00141550451478 | -0.532 | -0.415 | -0.34 |
| 5.004557097168369 | -0.53 | -0.413 | -0.339 |
| 5.007698689821958 | -0.528 | -0.411 | -0.337 |
| 5.010840282475548 | -0.526 | -0.41 | -0.336 |
| 5.013981875129137 | -0.524 | -0.408 | -0.335 |
| 5.017123467782727 | -0.522 | -0.406 | -0.333 |
| 5.020265060436317 | -0.52 | -0.405 | -0.332 |
| 5.023406653089906 | -0.518 | -0.403 | -0.33 |
| 5.026548245743496 | -0.516 | -0.401 | -0.329 |
| 5.029689838397085 | -0.514 | -0.4 | -0.327 |
| 5.032831431050674 | -0.512 | -0.398 | -0.326 |
| 5.035973023704264 | -0.51 | -0.397 | -0.325 |
| 5.039114616357854 | -0.508 | -0.395 | -0.323 |
| 5.042256209011444 | -0.507 | -0.393 | -0.322 |
| 5.045397801665033 | -0.505 | -0.392 | -0.321 |
| 5.048539394318622 | -0.503 | -0.39 | -0.319 |
| 5.051680986972213 | -0.501 | -0.389 | -0.318 |
| 5.054822579625802 | -0.499 | -0.387 | -0.317 |
| 5.057964172279392 | -0.497 | -0.386 | -0.315 |
| 5.061105764932981 | -0.495 | -0.384 | -0.314 |
| 5.064247357586571 | -0.493 | -0.382 | -0.313 |
| 5.067388950240161 | -0.492 | -0.381 | -0.311 |
| 5.07053054289375 | -0.49 | -0.379 | -0.31 |
| 5.07367213554734 | -0.488 | -0.378 | -0.309 |
| 5.07681372820093 | -0.486 | -0.376 | -0.307 |
| 5.079955320854519 | -0.484 | -0.375 | -0.306 |
| 5.083096913508108 | -0.482 | -0.373 | -0.305 |
| 5.086238506161698 | -0.481 | -0.372 | -0.303 |
| 5.089380098815288 | -0.479 | -0.37 | -0.302 |
| 5.092521691468877 | -0.477 | -0.369 | -0.301 |
| 5.095663284122466 | -0.475 | -0.367 | -0.3 |
| 5.098804876776057 | -0.473 | -0.366 | -0.298 |
| 5.101946469429646 | -0.472 | -0.364 | -0.297 |
| 5.105088062083236 | -0.47 | -0.363 | -0.296 |
| 5.108229654736825 | -0.468 | -0.361 | -0.295 |
| 5.111371247390415 | -0.466 | -0.36 | -0.293 |
| 5.114512840044005 | -0.464 | -0.359 | -0.292 |
| 5.117654432697594 | -0.463 | -0.357 | -0.291 |
| 5.120796025351184 | -0.461 | -0.356 | -0.29 |
| 5.123937618004773 | -0.459 | -0.354 | -0.289 |
| 5.127079210658363 | -0.457 | -0.353 | -0.287 |
| 5.130220803311953 | -0.456 | -0.351 | -0.286 |
| 5.133362395965542 | -0.454 | -0.35 | -0.285 |
| 5.136503988619131 | -0.452 | -0.349 | -0.284 |
| 5.13964558127272 | -0.451 | -0.347 | -0.283 |
| 5.142787173926311 | -0.449 | -0.346 | -0.281 |
| 5.1459287665799 | -0.447 | -0.344 | -0.28 |
| 5.14907035923349 | -0.445 | -0.343 | -0.279 |
| 5.15221195188708 | -0.444 | -0.342 | -0.278 |
| 5.15535354454067 | -0.442 | -0.34 | -0.277 |
| 5.158495137194259 | -0.44 | -0.339 | -0.276 |
| 5.161636729847848 | -0.439 | -0.338 | -0.274 |
| 5.164778322501438 | -0.437 | -0.336 | -0.273 |
| 5.167919915155028 | -0.435 | -0.335 | -0.272 |
| 5.171061507808617 | -0.434 | -0.333 | -0.271 |
| 5.174203100462206 | -0.432 | -0.332 | -0.27 |
| 5.177344693115796 | -0.43 | -0.331 | -0.269 |
| 5.180486285769386 | -0.429 | -0.329 | -0.268 |
| 5.183627878422976 | -0.427 | -0.328 | -0.267 |
| 5.186769471076565 | -0.425 | -0.327 | -0.265 |
| 5.189911063730155 | -0.424 | -0.325 | -0.264 |
| 5.193052656383744 | -0.422 | -0.324 | -0.263 |
| 5.196194249037334 | -0.42 | -0.323 | -0.262 |
| 5.199335841690924 | -0.419 | -0.321 | -0.261 |
| 5.202477434344513 | -0.417 | -0.32 | -0.26 |
| 5.205619026998103 | -0.416 | -0.319 | -0.259 |
| 5.208760619651692 | -0.414 | -0.318 | -0.258 |
| 5.211902212305282 | -0.412 | -0.316 | -0.257 |
| 5.215043804958871 | -0.411 | -0.315 | -0.256 |
| 5.218185397612461 | -0.409 | -0.314 | -0.254 |
| 5.221326990266051 | -0.408 | -0.312 | -0.253 |
| 5.22446858291964 | -0.406 | -0.311 | -0.252 |
| 5.22761017557323 | -0.404 | -0.31 | -0.251 |
| 5.23075176822682 | -0.403 | -0.309 | -0.25 |
| 5.23389336088041 | -0.401 | -0.307 | -0.249 |
| 5.237034953533999 | -0.4 | -0.306 | -0.248 |
| 5.240176546187588 | -0.398 | -0.305 | -0.247 |
| 5.243318138841178 | -0.397 | -0.304 | -0.246 |
| 5.246459731494767 | -0.395 | -0.302 | -0.245 |
| 5.249601324148357 | -0.393 | -0.301 | -0.244 |
| 5.252742916801947 | -0.392 | -0.3 | -0.243 |
| 5.255884509455536 | -0.39 | -0.299 | -0.242 |
| 5.259026102109125 | -0.389 | -0.297 | -0.241 |
| 5.262167694762715 | -0.387 | -0.296 | -0.24 |
| 5.265309287416305 | -0.386 | -0.295 | -0.239 |
| 5.268450880069895 | -0.384 | -0.294 | -0.238 |
| 5.271592472723484 | -0.383 | -0.293 | -0.237 |
| 5.274734065377074 | -0.381 | -0.291 | -0.236 |
| 5.277875658030664 | -0.38 | -0.29 | -0.235 |
| 5.281017250684253 | -0.378 | -0.289 | -0.234 |
| 5.284158843337843 | -0.377 | -0.288 | -0.233 |
| 5.287300435991432 | -0.375 | -0.287 | -0.232 |
| 5.290442028645022 | -0.374 | -0.285 | -0.231 |
| 5.293583621298612 | -0.372 | -0.284 | -0.23 |
| 5.296725213952201 | -0.371 | -0.283 | -0.229 |
| 5.299866806605791 | -0.369 | -0.282 | -0.228 |
| 5.30300839925938 | -0.368 | -0.281 | -0.227 |
| 5.30614999191297 | -0.366 | -0.279 | -0.226 |
| 5.30929158456656 | -0.365 | -0.278 | -0.225 |
| 5.312433177220149 | -0.363 | -0.277 | -0.224 |
| 5.315574769873739 | -0.362 | -0.276 | -0.223 |
| 5.318716362527328 | -0.36 | -0.275 | -0.222 |
| 5.321857955180918 | -0.359 | -0.274 | -0.221 |
| 5.324999547834508 | -0.357 | -0.272 | -0.22 |
| 5.328141140488097 | -0.356 | -0.271 | -0.219 |
| 5.331282733141686 | -0.354 | -0.27 | -0.218 |
| 5.334424325795276 | -0.353 | -0.269 | -0.217 |
| 5.337565918448866 | -0.351 | -0.268 | -0.216 |
| 5.340707511102456 | -0.35 | -0.267 | -0.216 |
| 5.343849103756045 | -0.349 | -0.266 | -0.215 |
| 5.346990696409634 | -0.347 | -0.264 | -0.214 |
| 5.350132289063224 | -0.346 | -0.263 | -0.213 |
| 5.353273881716814 | -0.344 | -0.262 | -0.212 |
| 5.356415474370403 | -0.343 | -0.261 | -0.211 |
| 5.359557067023993 | -0.341 | -0.26 | -0.21 |
| 5.362698659677583 | -0.34 | -0.259 | -0.209 |
| 5.365840252331172 | -0.339 | -0.258 | -0.208 |
| 5.368981844984762 | -0.337 | -0.257 | -0.207 |
| 5.372123437638351 | -0.336 | -0.256 | -0.206 |
| 5.375265030291941 | -0.334 | -0.254 | -0.205 |
| 5.378406622945531 | -0.333 | -0.253 | -0.204 |
| 5.38154821559912 | -0.332 | -0.252 | -0.204 |
| 5.38468980825271 | -0.33 | -0.251 | -0.203 |
| 5.387831400906299 | -0.329 | -0.25 | -0.202 |
| 5.39097299355989 | -0.327 | -0.249 | -0.201 |
| 5.394114586213479 | -0.326 | -0.248 | -0.2 |
| 5.397256178867068 | -0.325 | -0.247 | -0.199 |
| 5.400397771520657 | -0.323 | -0.246 | -0.198 |
| 5.403539364174247 | -0.322 | -0.245 | -0.197 |
| 5.406680956827837 | -0.32 | -0.244 | -0.196 |
| 5.409822549481426 | -0.319 | -0.242 | -0.196 |
| 5.412964142135016 | -0.318 | -0.241 | -0.195 |
| 5.416105734788605 | -0.316 | -0.24 | -0.194 |
| 5.419247327442195 | -0.315 | -0.239 | -0.193 |
| 5.422388920095785 | -0.314 | -0.238 | -0.192 |
| 5.425530512749375 | -0.312 | -0.237 | -0.191 |
| 5.428672105402964 | -0.311 | -0.236 | -0.19 |
| 5.431813698056554 | -0.309 | -0.235 | -0.189 |
| 5.434955290710143 | -0.308 | -0.234 | -0.189 |
| 5.438096883363733 | -0.307 | -0.233 | -0.188 |
| 5.441238476017322 | -0.305 | -0.232 | -0.187 |
| 5.444380068670912 | -0.304 | -0.231 | -0.186 |
| 5.447521661324502 | -0.303 | -0.23 | -0.185 |
| 5.450663253978091 | -0.301 | -0.229 | -0.184 |
| 5.453804846631681 | -0.3 | -0.228 | -0.183 |
| 5.456946439285271 | -0.299 | -0.227 | -0.183 |
| 5.46008803193886 | -0.297 | -0.226 | -0.182 |
| 5.46322962459245 | -0.296 | -0.225 | -0.181 |
| 5.466371217246039 | -0.295 | -0.224 | -0.18 |
| 5.46951280989963 | -0.293 | -0.223 | -0.179 |
| 5.472654402553218 | -0.292 | -0.221 | -0.178 |
| 5.475795995206808 | -0.291 | -0.22 | -0.178 |
| 5.478937587860398 | -0.289 | -0.219 | -0.177 |
| 5.482079180513987 | -0.288 | -0.218 | -0.176 |
| 5.485220773167577 | -0.287 | -0.217 | -0.175 |
| 5.488362365821166 | -0.286 | -0.216 | -0.174 |
| 5.491503958474756 | -0.284 | -0.215 | -0.173 |
| 5.494645551128346 | -0.283 | -0.214 | -0.173 |
| 5.497787143781935 | -0.282 | -0.213 | -0.172 |
| 5.500928736435525 | -0.28 | -0.212 | -0.171 |
| 5.504070329089115 | -0.279 | -0.211 | -0.17 |
| 5.507211921742704 | -0.278 | -0.21 | -0.169 |
| 5.510353514396294 | -0.276 | -0.209 | -0.168 |
| 5.513495107049883 | -0.275 | -0.208 | -0.168 |
| 5.516636699703473 | -0.274 | -0.207 | -0.167 |
| 5.519778292357062 | -0.273 | -0.206 | -0.166 |
| 5.522919885010652 | -0.271 | -0.205 | -0.165 |
| 5.526061477664242 | -0.27 | -0.204 | -0.164 |
| 5.529203070317831 | -0.269 | -0.203 | -0.164 |
| 5.532344662971421 | -0.267 | -0.202 | -0.163 |
| 5.535486255625011 | -0.266 | -0.201 | -0.162 |
| 5.5386278482786 | -0.265 | -0.2 | -0.161 |
| 5.54176944093219 | -0.264 | -0.199 | -0.16 |
| 5.544911033585779 | -0.262 | -0.198 | -0.16 |
| 5.54805262623937 | -0.261 | -0.198 | -0.159 |
| 5.551194218892959 | -0.26 | -0.197 | -0.158 |
| 5.554335811546548 | -0.259 | -0.196 | -0.157 |
| 5.557477404200137 | -0.257 | -0.195 | -0.156 |
| 5.560618996853727 | -0.256 | -0.194 | -0.156 |
| 5.563760589507317 | -0.255 | -0.193 | -0.155 |
| 5.566902182160906 | -0.254 | -0.192 | -0.154 |
| 5.570043774814496 | -0.252 | -0.191 | -0.153 |
| 5.573185367468086 | -0.251 | -0.19 | -0.153 |
| 5.576326960121675 | -0.25 | -0.189 | -0.152 |
| 5.579468552775264 | -0.249 | -0.188 | -0.151 |
| 5.582610145428854 | -0.247 | -0.187 | -0.15 |
| 5.585751738082444 | -0.246 | -0.186 | -0.149 |
| 5.588893330736034 | -0.245 | -0.185 | -0.149 |
| 5.592034923389623 | -0.244 | -0.184 | -0.148 |
| 5.595176516043213 | -0.242 | -0.183 | -0.147 |
| 5.598318108696803 | -0.241 | -0.182 | -0.146 |
| 5.601459701350392 | -0.24 | -0.181 | -0.146 |
| 5.604601294003982 | -0.239 | -0.18 | -0.145 |
| 5.607742886657571 | -0.237 | -0.179 | -0.144 |
| 5.610884479311161 | -0.236 | -0.178 | -0.143 |
| 5.61402607196475 | -0.235 | -0.177 | -0.143 |
| 5.61716766461834 | -0.234 | -0.177 | -0.142 |
| 5.62030925727193 | -0.233 | -0.176 | -0.141 |
| 5.623450849925519 | -0.231 | -0.175 | -0.14 |
| 5.626592442579109 | -0.23 | -0.174 | -0.14 |
| 5.629734035232698 | -0.229 | -0.173 | -0.139 |
| 5.632875627886288 | -0.228 | -0.172 | -0.138 |
| 5.636017220539878 | -0.226 | -0.171 | -0.137 |
| 5.639158813193467 | -0.225 | -0.17 | -0.137 |
| 5.642300405847057 | -0.224 | -0.169 | -0.136 |
| 5.645441998500646 | -0.223 | -0.168 | -0.135 |
| 5.648583591154236 | -0.222 | -0.167 | -0.134 |
| 5.651725183807825 | -0.22 | -0.166 | -0.134 |
| 5.654866776461415 | -0.219 | -0.165 | -0.133 |
| 5.658008369115005 | -0.218 | -0.164 | -0.132 |
| 5.661149961768594 | -0.217 | -0.164 | -0.131 |
| 5.664291554422184 | -0.216 | -0.163 | -0.131 |
| 5.667433147075774 | -0.214 | -0.162 | -0.13 |
| 5.670574739729363 | -0.213 | -0.161 | -0.129 |
| 5.673716332382953 | -0.212 | -0.16 | -0.128 |
| 5.676857925036542 | -0.211 | -0.159 | -0.128 |
| 5.679999517690132 | -0.21 | -0.158 | -0.127 |
| 5.683141110343721 | -0.208 | -0.157 | -0.126 |
| 5.686282702997311 | -0.207 | -0.156 | -0.125 |
| 5.689424295650901 | -0.206 | -0.155 | -0.125 |
| 5.69256588830449 | -0.205 | -0.155 | -0.124 |
| 5.69570748095808 | -0.204 | -0.154 | -0.123 |
| 5.69884907361167 | -0.203 | -0.153 | -0.123 |
| 5.701990666265259 | -0.201 | -0.152 | -0.122 |
| 5.705132258918849 | -0.2 | -0.151 | -0.121 |
| 5.708273851572438 | -0.199 | -0.15 | -0.12 |
| 5.711415444226028 | -0.198 | -0.149 | -0.12 |
| 5.714557036879618 | -0.197 | -0.148 | -0.119 |
| 5.717698629533207 | -0.196 | -0.147 | -0.118 |
| 5.720840222186797 | -0.194 | -0.146 | -0.118 |
| 5.723981814840386 | -0.193 | -0.146 | -0.117 |
| 5.727123407493976 | -0.192 | -0.145 | -0.116 |
| 5.730265000147565 | -0.191 | -0.144 | -0.115 |
| 5.733406592801155 | -0.19 | -0.143 | -0.115 |
| 5.736548185454744 | -0.189 | -0.142 | -0.114 |
| 5.739689778108334 | -0.187 | -0.141 | -0.113 |
| 5.742831370761924 | -0.186 | -0.14 | -0.113 |
| 5.745972963415514 | -0.185 | -0.139 | -0.112 |
| 5.749114556069103 | -0.184 | -0.139 | -0.111 |
| 5.752256148722693 | -0.183 | -0.138 | -0.11 |
| 5.755397741376282 | -0.182 | -0.137 | -0.11 |
| 5.758539334029872 | -0.18 | -0.136 | -0.109 |
| 5.761680926683462 | -0.179 | -0.135 | -0.108 |
| 5.764822519337051 | -0.178 | -0.134 | -0.108 |
| 5.767964111990641 | -0.177 | -0.133 | -0.107 |
| 5.77110570464423 | -0.176 | -0.132 | -0.106 |
| 5.77424729729782 | -0.175 | -0.132 | -0.105 |
| 5.77738888995141 | -0.174 | -0.131 | -0.105 |
| 5.780530482605 | -0.172 | -0.13 | -0.104 |
| 5.783672075258588 | -0.171 | -0.129 | -0.103 |
| 5.786813667912178 | -0.17 | -0.128 | -0.103 |
| 5.789955260565768 | -0.169 | -0.127 | -0.102 |
| 5.793096853219358 | -0.168 | -0.126 | -0.101 |
| 5.796238445872947 | -0.167 | -0.126 | -0.101 |
| 5.799380038526537 | -0.166 | -0.125 | -0.1 |
| 5.802521631180126 | -0.164 | -0.124 | -0.099 |
| 5.805663223833715 | -0.163 | -0.123 | -0.099 |
| 5.808804816487306 | -0.162 | -0.122 | -0.098 |
| 5.811946409140895 | -0.161 | -0.121 | -0.097 |
| 5.815088001794485 | -0.16 | -0.12 | -0.096 |
| 5.818229594448074 | -0.159 | -0.12 | -0.096 |
| 5.821371187101663 | -0.158 | -0.119 | -0.095 |
| 5.824512779755254 | -0.157 | -0.118 | -0.094 |
| 5.827654372408843 | -0.155 | -0.117 | -0.094 |
| 5.830795965062433 | -0.154 | -0.116 | -0.093 |
| 5.833937557716022 | -0.153 | -0.115 | -0.092 |
| 5.837079150369612 | -0.152 | -0.114 | -0.092 |
| 5.840220743023201 | -0.151 | -0.114 | -0.091 |
| 5.843362335676791 | -0.15 | -0.113 | -0.09 |
| 5.846503928330381 | -0.149 | -0.112 | -0.09 |
| 5.84964552098397 | -0.148 | -0.111 | -0.089 |
| 5.85278711363756 | -0.147 | -0.11 | -0.088 |
| 5.85592870629115 | -0.145 | -0.109 | -0.088 |
| 5.85907029894474 | -0.144 | -0.108 | -0.087 |
| 5.862211891598329 | -0.143 | -0.108 | -0.086 |
| 5.865353484251918 | -0.142 | -0.107 | -0.086 |
| 5.868495076905508 | -0.141 | -0.106 | -0.085 |
| 5.871636669559098 | -0.14 | -0.105 | -0.084 |
| 5.874778262212687 | -0.139 | -0.104 | -0.084 |
| 5.877919854866277 | -0.138 | -0.103 | -0.083 |
| 5.881061447519866 | -0.137 | -0.103 | -0.082 |
| 5.884203040173456 | -0.135 | -0.102 | -0.082 |
| 5.887344632827046 | -0.134 | -0.101 | -0.081 |
| 5.890486225480635 | -0.133 | -0.1 | -0.08 |
| 5.893627818134224 | -0.132 | -0.099 | -0.08 |
| 5.896769410787814 | -0.131 | -0.098 | -0.079 |
| 5.899911003441404 | -0.13 | -0.098 | -0.078 |
| 5.903052596094994 | -0.129 | -0.097 | -0.078 |
| 5.906194188748583 | -0.128 | -0.096 | -0.077 |
| 5.909335781402172 | -0.127 | -0.095 | -0.076 |
| 5.912477374055762 | -0.125 | -0.094 | -0.076 |
| 5.915618966709352 | -0.124 | -0.093 | -0.075 |
| 5.918760559362942 | -0.123 | -0.093 | -0.074 |
| 5.921902152016531 | -0.122 | -0.092 | -0.074 |
| 5.92504374467012 | -0.121 | -0.091 | -0.073 |
| 5.92818533732371 | -0.12 | -0.09 | -0.072 |
| 5.9313269299773 | -0.119 | -0.089 | -0.072 |
| 5.93446852263089 | -0.118 | -0.089 | -0.071 |
| 5.93761011528448 | -0.117 | -0.088 | -0.07 |
| 5.940751707938068 | -0.116 | -0.087 | -0.07 |
| 5.943893300591658 | -0.115 | -0.086 | -0.069 |
| 5.947034893245248 | -0.113 | -0.085 | -0.068 |
| 5.950176485898837 | -0.112 | -0.084 | -0.068 |
| 5.953318078552427 | -0.111 | -0.084 | -0.067 |
| 5.956459671206017 | -0.11 | -0.083 | -0.066 |
| 5.959601263859606 | -0.109 | -0.082 | -0.066 |
| 5.962742856513196 | -0.108 | -0.081 | -0.065 |
| 5.965884449166785 | -0.107 | -0.08 | -0.064 |
| 5.969026041820375 | -0.106 | -0.08 | -0.064 |
| 5.972167634473964 | -0.105 | -0.079 | -0.063 |
| 5.975309227127554 | -0.104 | -0.078 | -0.062 |
| 5.978450819781144 | -0.103 | -0.077 | -0.062 |
| 5.981592412434733 | -0.102 | -0.076 | -0.061 |
| 5.984734005088323 | -0.1 | -0.075 | -0.06 |
| 5.987875597741913 | -0.099 | -0.075 | -0.06 |
| 5.991017190395502 | -0.098 | -0.074 | -0.059 |
| 5.994158783049092 | -0.097 | -0.073 | -0.058 |
| 5.997300375702681 | -0.096 | -0.072 | -0.058 |
| 6.000441968356271 | -0.095 | -0.071 | -0.057 |
| 6.003583561009861 | -0.094 | -0.071 | -0.057 |
| 6.00672515366345 | -0.093 | -0.07 | -0.056 |
| 6.00986674631704 | -0.092 | -0.069 | -0.055 |
| 6.01300833897063 | -0.091 | -0.068 | -0.055 |
| 6.01614993162422 | -0.09 | -0.067 | -0.054 |
| 6.019291524277808 | -0.089 | -0.067 | -0.053 |
| 6.022433116931398 | -0.088 | -0.066 | -0.053 |
| 6.025574709584988 | -0.087 | -0.065 | -0.052 |
| 6.028716302238577 | -0.085 | -0.064 | -0.051 |
| 6.031857894892167 | -0.084 | -0.063 | -0.051 |
| 6.034999487545757 | -0.083 | -0.063 | -0.05 |
| 6.038141080199346 | -0.082 | -0.062 | -0.049 |
| 6.041282672852935 | -0.081 | -0.061 | -0.049 |
| 6.044424265506525 | -0.08 | -0.06 | -0.048 |
| 6.047565858160115 | -0.079 | -0.059 | -0.047 |
| 6.050707450813704 | -0.078 | -0.059 | -0.047 |
| 6.053849043467294 | -0.077 | -0.058 | -0.046 |
| 6.056990636120884 | -0.076 | -0.057 | -0.046 |
| 6.060132228774473 | -0.075 | -0.056 | -0.045 |
| 6.063273821428063 | -0.074 | -0.055 | -0.044 |
| 6.066415414081653 | -0.073 | -0.055 | -0.044 |
| 6.069557006735242 | -0.072 | -0.054 | -0.043 |
| 6.072698599388831 | -0.071 | -0.053 | -0.042 |
| 6.07584019204242 | -0.069 | -0.052 | -0.042 |
| 6.078981784696011 | -0.068 | -0.051 | -0.041 |
| 6.082123377349601 | -0.067 | -0.051 | -0.04 |
| 6.08526497000319 | -0.066 | -0.05 | -0.04 |
| 6.08840656265678 | -0.065 | -0.049 | -0.039 |
| 6.09154815531037 | -0.064 | -0.048 | -0.039 |
| 6.094689747963959 | -0.063 | -0.047 | -0.038 |
| 6.097831340617549 | -0.062 | -0.047 | -0.037 |
| 6.100972933271138 | -0.061 | -0.046 | -0.037 |
| 6.104114525924728 | -0.06 | -0.045 | -0.036 |
| 6.107256118578317 | -0.059 | -0.044 | -0.035 |
| 6.110397711231907 | -0.058 | -0.043 | -0.035 |
| 6.113539303885497 | -0.057 | -0.043 | -0.034 |
| 6.116680896539086 | -0.056 | -0.042 | -0.033 |
| 6.119822489192675 | -0.055 | -0.041 | -0.033 |
| 6.122964081846265 | -0.054 | -0.04 | -0.032 |
| 6.126105674499855 | -0.053 | -0.039 | -0.032 |
| 6.129247267153445 | -0.051 | -0.039 | -0.031 |
| 6.132388859807034 | -0.05 | -0.038 | -0.03 |
| 6.135530452460624 | -0.049 | -0.037 | -0.03 |
| 6.138672045114213 | -0.048 | -0.036 | -0.029 |
| 6.141813637767803 | -0.047 | -0.035 | -0.028 |
| 6.144955230421393 | -0.046 | -0.035 | -0.028 |
| 6.148096823074982 | -0.045 | -0.034 | -0.027 |
| 6.151238415728571 | -0.044 | -0.033 | -0.026 |
| 6.154380008382161 | -0.043 | -0.032 | -0.026 |
| 6.157521601035751 | -0.042 | -0.031 | -0.025 |
| 6.16066319368934 | -0.041 | -0.031 | -0.025 |
| 6.16380478634293 | -0.04 | -0.03 | -0.024 |
| 6.16694637899652 | -0.039 | -0.029 | -0.023 |
| 6.170087971650109 | -0.038 | -0.028 | -0.023 |
| 6.173229564303698 | -0.037 | -0.028 | -0.022 |
| 6.176371156957289 | -0.036 | -0.027 | -0.021 |
| 6.179512749610878 | -0.035 | -0.026 | -0.021 |
| 6.182654342264468 | -0.034 | -0.025 | -0.02 |
| 6.185795934918057 | -0.032 | -0.024 | -0.02 |
| 6.188937527571647 | -0.031 | -0.024 | -0.019 |
| 6.192079120225237 | -0.03 | -0.023 | -0.018 |
| 6.195220712878826 | -0.029 | -0.022 | -0.018 |
| 6.198362305532415 | -0.028 | -0.021 | -0.017 |
| 6.201503898186005 | -0.027 | -0.02 | -0.016 |
| 6.204645490839594 | -0.026 | -0.02 | -0.016 |
| 6.207787083493184 | -0.025 | -0.019 | -0.015 |
| 6.210928676146774 | -0.024 | -0.018 | -0.014 |
| 6.214070268800364 | -0.023 | -0.017 | -0.014 |
| 6.217211861453953 | -0.022 | -0.017 | -0.013 |
| 6.220353454107543 | -0.021 | -0.016 | -0.013 |
| 6.223495046761133 | -0.02 | -0.015 | -0.012 |
| 6.226636639414722 | -0.019 | -0.014 | -0.011 |
| 6.229778232068312 | -0.018 | -0.013 | -0.011 |
| 6.232919824721901 | -0.017 | -0.013 | -0.01 |
| 6.236061417375491 | -0.016 | -0.012 | -0.009 |
| 6.23920301002908 | -0.015 | -0.011 | -0.009 |
| 6.24234460268267 | -0.014 | -0.01 | -0.008 |
| 6.24548619533626 | -0.013 | -0.009 | -0.008 |
| 6.24862778798985 | -0.012 | -0.009 | -0.007 |
| 6.251769380643438 | -0.01 | -0.008 | -0.006 |
| 6.254910973297028 | -0.009 | -0.007 | -0.006 |
| 6.258052565950618 | -0.008 | -0.006 | -0.005 |
| 6.261194158604208 | -0.007 | -0.005 | -0.004 |
| 6.264335751257797 | -0.006 | -0.005 | -0.004 |
| 6.267477343911387 | -0.005 | -0.004 | -0.003 |
| 6.270618936564976 | -0.004 | -0.003 | -0.003 |
| 6.273760529218566 | -0.003 | -0.002 | -0.002 |
| 6.276902121872155 | -0.002 | -0.002 | -0.001 |
| 6.280043714525745 | -0.001 | -0.001 | -0.001 |
| 6.283185307179335 | 0 | 0 | 0 |